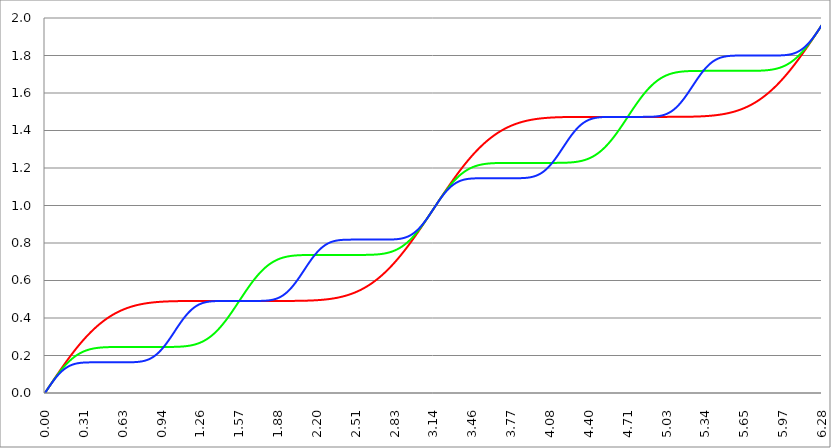
| Category | Series 1 | Series 0 | Series 2 |
|---|---|---|---|
| 0.0 | 0 | 0 | 0 |
| 0.00314159265358979 | 0.003 | 0.003 | 0.003 |
| 0.00628318530717958 | 0.006 | 0.006 | 0.006 |
| 0.00942477796076938 | 0.009 | 0.009 | 0.009 |
| 0.0125663706143592 | 0.013 | 0.013 | 0.013 |
| 0.015707963267949 | 0.016 | 0.016 | 0.016 |
| 0.0188495559215388 | 0.019 | 0.019 | 0.019 |
| 0.0219911485751285 | 0.022 | 0.022 | 0.022 |
| 0.0251327412287183 | 0.025 | 0.025 | 0.025 |
| 0.0282743338823081 | 0.028 | 0.028 | 0.028 |
| 0.0314159265358979 | 0.031 | 0.031 | 0.031 |
| 0.0345575191894877 | 0.035 | 0.034 | 0.034 |
| 0.0376991118430775 | 0.038 | 0.037 | 0.037 |
| 0.0408407044966673 | 0.041 | 0.041 | 0.04 |
| 0.0439822971502571 | 0.044 | 0.044 | 0.043 |
| 0.0471238898038469 | 0.047 | 0.047 | 0.046 |
| 0.0502654824574367 | 0.05 | 0.05 | 0.049 |
| 0.0534070751110265 | 0.053 | 0.053 | 0.052 |
| 0.0565486677646163 | 0.056 | 0.056 | 0.055 |
| 0.059690260418206 | 0.059 | 0.059 | 0.058 |
| 0.0628318530717958 | 0.063 | 0.062 | 0.061 |
| 0.0659734457253856 | 0.066 | 0.065 | 0.063 |
| 0.0691150383789754 | 0.069 | 0.068 | 0.066 |
| 0.0722566310325652 | 0.072 | 0.071 | 0.069 |
| 0.075398223686155 | 0.075 | 0.074 | 0.072 |
| 0.0785398163397448 | 0.078 | 0.077 | 0.074 |
| 0.0816814089933346 | 0.081 | 0.08 | 0.077 |
| 0.0848230016469244 | 0.084 | 0.082 | 0.08 |
| 0.0879645943005142 | 0.087 | 0.085 | 0.082 |
| 0.091106186954104 | 0.09 | 0.088 | 0.085 |
| 0.0942477796076937 | 0.093 | 0.091 | 0.087 |
| 0.0973893722612835 | 0.096 | 0.094 | 0.09 |
| 0.100530964914873 | 0.1 | 0.097 | 0.092 |
| 0.103672557568463 | 0.103 | 0.099 | 0.094 |
| 0.106814150222053 | 0.106 | 0.102 | 0.097 |
| 0.109955742875643 | 0.109 | 0.105 | 0.099 |
| 0.113097335529233 | 0.112 | 0.108 | 0.101 |
| 0.116238928182822 | 0.115 | 0.11 | 0.103 |
| 0.119380520836412 | 0.118 | 0.113 | 0.106 |
| 0.122522113490002 | 0.121 | 0.116 | 0.108 |
| 0.125663706143592 | 0.124 | 0.118 | 0.11 |
| 0.128805298797181 | 0.127 | 0.121 | 0.112 |
| 0.131946891450771 | 0.13 | 0.123 | 0.114 |
| 0.135088484104361 | 0.133 | 0.126 | 0.116 |
| 0.138230076757951 | 0.136 | 0.128 | 0.117 |
| 0.141371669411541 | 0.139 | 0.131 | 0.119 |
| 0.14451326206513 | 0.142 | 0.133 | 0.121 |
| 0.14765485471872 | 0.144 | 0.136 | 0.123 |
| 0.15079644737231 | 0.147 | 0.138 | 0.124 |
| 0.1539380400259 | 0.15 | 0.14 | 0.126 |
| 0.15707963267949 | 0.153 | 0.143 | 0.128 |
| 0.160221225333079 | 0.156 | 0.145 | 0.129 |
| 0.163362817986669 | 0.159 | 0.147 | 0.131 |
| 0.166504410640259 | 0.162 | 0.15 | 0.132 |
| 0.169646003293849 | 0.165 | 0.152 | 0.134 |
| 0.172787595947439 | 0.168 | 0.154 | 0.135 |
| 0.175929188601028 | 0.171 | 0.156 | 0.136 |
| 0.179070781254618 | 0.173 | 0.158 | 0.138 |
| 0.182212373908208 | 0.176 | 0.16 | 0.139 |
| 0.185353966561798 | 0.179 | 0.162 | 0.14 |
| 0.188495559215388 | 0.182 | 0.165 | 0.141 |
| 0.191637151868977 | 0.185 | 0.167 | 0.142 |
| 0.194778744522567 | 0.188 | 0.169 | 0.143 |
| 0.197920337176157 | 0.19 | 0.17 | 0.144 |
| 0.201061929829747 | 0.193 | 0.172 | 0.145 |
| 0.204203522483336 | 0.196 | 0.174 | 0.146 |
| 0.207345115136926 | 0.199 | 0.176 | 0.147 |
| 0.210486707790516 | 0.201 | 0.178 | 0.148 |
| 0.213628300444106 | 0.204 | 0.18 | 0.149 |
| 0.216769893097696 | 0.207 | 0.182 | 0.15 |
| 0.219911485751285 | 0.21 | 0.183 | 0.151 |
| 0.223053078404875 | 0.212 | 0.185 | 0.151 |
| 0.226194671058465 | 0.215 | 0.187 | 0.152 |
| 0.229336263712055 | 0.218 | 0.188 | 0.153 |
| 0.232477856365645 | 0.22 | 0.19 | 0.153 |
| 0.235619449019234 | 0.223 | 0.192 | 0.154 |
| 0.238761041672824 | 0.226 | 0.193 | 0.155 |
| 0.241902634326414 | 0.228 | 0.195 | 0.155 |
| 0.245044226980004 | 0.231 | 0.196 | 0.156 |
| 0.248185819633594 | 0.234 | 0.198 | 0.156 |
| 0.251327412287183 | 0.236 | 0.199 | 0.157 |
| 0.254469004940773 | 0.239 | 0.2 | 0.157 |
| 0.257610597594363 | 0.241 | 0.202 | 0.158 |
| 0.260752190247953 | 0.244 | 0.203 | 0.158 |
| 0.263893782901543 | 0.247 | 0.204 | 0.158 |
| 0.267035375555132 | 0.249 | 0.206 | 0.159 |
| 0.270176968208722 | 0.252 | 0.207 | 0.159 |
| 0.273318560862312 | 0.254 | 0.208 | 0.159 |
| 0.276460153515902 | 0.257 | 0.209 | 0.16 |
| 0.279601746169492 | 0.259 | 0.211 | 0.16 |
| 0.282743338823082 | 0.262 | 0.212 | 0.16 |
| 0.285884931476671 | 0.264 | 0.213 | 0.161 |
| 0.289026524130261 | 0.266 | 0.214 | 0.161 |
| 0.292168116783851 | 0.269 | 0.215 | 0.161 |
| 0.295309709437441 | 0.271 | 0.216 | 0.161 |
| 0.298451302091031 | 0.274 | 0.217 | 0.161 |
| 0.30159289474462 | 0.276 | 0.218 | 0.162 |
| 0.30473448739821 | 0.278 | 0.219 | 0.162 |
| 0.3078760800518 | 0.281 | 0.22 | 0.162 |
| 0.31101767270539 | 0.283 | 0.221 | 0.162 |
| 0.31415926535898 | 0.285 | 0.222 | 0.162 |
| 0.31730085801257 | 0.288 | 0.223 | 0.162 |
| 0.320442450666159 | 0.29 | 0.224 | 0.163 |
| 0.323584043319749 | 0.292 | 0.224 | 0.163 |
| 0.326725635973339 | 0.295 | 0.225 | 0.163 |
| 0.329867228626929 | 0.297 | 0.226 | 0.163 |
| 0.333008821280519 | 0.299 | 0.227 | 0.163 |
| 0.336150413934108 | 0.301 | 0.227 | 0.163 |
| 0.339292006587698 | 0.304 | 0.228 | 0.163 |
| 0.342433599241288 | 0.306 | 0.229 | 0.163 |
| 0.345575191894878 | 0.308 | 0.23 | 0.163 |
| 0.348716784548468 | 0.31 | 0.23 | 0.163 |
| 0.351858377202058 | 0.312 | 0.231 | 0.163 |
| 0.354999969855647 | 0.314 | 0.231 | 0.163 |
| 0.358141562509237 | 0.317 | 0.232 | 0.163 |
| 0.361283155162827 | 0.319 | 0.233 | 0.163 |
| 0.364424747816417 | 0.321 | 0.233 | 0.163 |
| 0.367566340470007 | 0.323 | 0.234 | 0.163 |
| 0.370707933123597 | 0.325 | 0.234 | 0.163 |
| 0.373849525777186 | 0.327 | 0.235 | 0.163 |
| 0.376991118430776 | 0.329 | 0.235 | 0.163 |
| 0.380132711084366 | 0.331 | 0.236 | 0.164 |
| 0.383274303737956 | 0.333 | 0.236 | 0.164 |
| 0.386415896391546 | 0.335 | 0.236 | 0.164 |
| 0.389557489045135 | 0.337 | 0.237 | 0.164 |
| 0.392699081698725 | 0.339 | 0.237 | 0.164 |
| 0.395840674352315 | 0.341 | 0.238 | 0.164 |
| 0.398982267005905 | 0.343 | 0.238 | 0.164 |
| 0.402123859659495 | 0.345 | 0.238 | 0.164 |
| 0.405265452313085 | 0.347 | 0.239 | 0.164 |
| 0.408407044966674 | 0.349 | 0.239 | 0.164 |
| 0.411548637620264 | 0.35 | 0.239 | 0.164 |
| 0.414690230273854 | 0.352 | 0.24 | 0.164 |
| 0.417831822927444 | 0.354 | 0.24 | 0.164 |
| 0.420973415581034 | 0.356 | 0.24 | 0.164 |
| 0.424115008234623 | 0.358 | 0.241 | 0.164 |
| 0.427256600888213 | 0.36 | 0.241 | 0.164 |
| 0.430398193541803 | 0.361 | 0.241 | 0.164 |
| 0.433539786195393 | 0.363 | 0.241 | 0.164 |
| 0.436681378848983 | 0.365 | 0.242 | 0.164 |
| 0.439822971502573 | 0.367 | 0.242 | 0.164 |
| 0.442964564156162 | 0.368 | 0.242 | 0.164 |
| 0.446106156809752 | 0.37 | 0.242 | 0.164 |
| 0.449247749463342 | 0.372 | 0.242 | 0.164 |
| 0.452389342116932 | 0.373 | 0.242 | 0.164 |
| 0.455530934770522 | 0.375 | 0.243 | 0.164 |
| 0.458672527424111 | 0.377 | 0.243 | 0.164 |
| 0.461814120077701 | 0.378 | 0.243 | 0.164 |
| 0.464955712731291 | 0.38 | 0.243 | 0.164 |
| 0.468097305384881 | 0.381 | 0.243 | 0.164 |
| 0.471238898038471 | 0.383 | 0.243 | 0.164 |
| 0.474380490692061 | 0.385 | 0.244 | 0.164 |
| 0.47752208334565 | 0.386 | 0.244 | 0.164 |
| 0.48066367599924 | 0.388 | 0.244 | 0.164 |
| 0.48380526865283 | 0.389 | 0.244 | 0.164 |
| 0.48694686130642 | 0.391 | 0.244 | 0.164 |
| 0.49008845396001 | 0.392 | 0.244 | 0.164 |
| 0.493230046613599 | 0.394 | 0.244 | 0.164 |
| 0.496371639267189 | 0.395 | 0.244 | 0.164 |
| 0.499513231920779 | 0.397 | 0.244 | 0.164 |
| 0.502654824574369 | 0.398 | 0.244 | 0.164 |
| 0.505796417227959 | 0.399 | 0.244 | 0.164 |
| 0.508938009881549 | 0.401 | 0.245 | 0.164 |
| 0.512079602535138 | 0.402 | 0.245 | 0.164 |
| 0.515221195188728 | 0.404 | 0.245 | 0.164 |
| 0.518362787842318 | 0.405 | 0.245 | 0.164 |
| 0.521504380495908 | 0.406 | 0.245 | 0.164 |
| 0.524645973149498 | 0.408 | 0.245 | 0.164 |
| 0.527787565803087 | 0.409 | 0.245 | 0.164 |
| 0.530929158456677 | 0.41 | 0.245 | 0.164 |
| 0.534070751110267 | 0.412 | 0.245 | 0.164 |
| 0.537212343763857 | 0.413 | 0.245 | 0.164 |
| 0.540353936417447 | 0.414 | 0.245 | 0.164 |
| 0.543495529071037 | 0.415 | 0.245 | 0.164 |
| 0.546637121724626 | 0.417 | 0.245 | 0.164 |
| 0.549778714378216 | 0.418 | 0.245 | 0.164 |
| 0.552920307031806 | 0.419 | 0.245 | 0.164 |
| 0.556061899685396 | 0.42 | 0.245 | 0.164 |
| 0.559203492338986 | 0.421 | 0.245 | 0.164 |
| 0.562345084992576 | 0.422 | 0.245 | 0.164 |
| 0.565486677646165 | 0.424 | 0.245 | 0.164 |
| 0.568628270299755 | 0.425 | 0.245 | 0.164 |
| 0.571769862953345 | 0.426 | 0.245 | 0.164 |
| 0.574911455606935 | 0.427 | 0.245 | 0.164 |
| 0.578053048260525 | 0.428 | 0.245 | 0.164 |
| 0.581194640914114 | 0.429 | 0.245 | 0.164 |
| 0.584336233567704 | 0.43 | 0.245 | 0.164 |
| 0.587477826221294 | 0.431 | 0.245 | 0.164 |
| 0.590619418874884 | 0.432 | 0.245 | 0.164 |
| 0.593761011528474 | 0.433 | 0.245 | 0.164 |
| 0.596902604182064 | 0.434 | 0.245 | 0.164 |
| 0.600044196835653 | 0.435 | 0.245 | 0.164 |
| 0.603185789489243 | 0.436 | 0.245 | 0.164 |
| 0.606327382142833 | 0.437 | 0.245 | 0.164 |
| 0.609468974796423 | 0.438 | 0.245 | 0.164 |
| 0.612610567450013 | 0.439 | 0.245 | 0.164 |
| 0.615752160103602 | 0.44 | 0.245 | 0.164 |
| 0.618893752757192 | 0.441 | 0.245 | 0.164 |
| 0.622035345410782 | 0.442 | 0.245 | 0.164 |
| 0.625176938064372 | 0.443 | 0.245 | 0.164 |
| 0.628318530717962 | 0.444 | 0.245 | 0.164 |
| 0.631460123371551 | 0.445 | 0.245 | 0.164 |
| 0.634601716025141 | 0.445 | 0.245 | 0.164 |
| 0.637743308678731 | 0.446 | 0.245 | 0.164 |
| 0.640884901332321 | 0.447 | 0.245 | 0.164 |
| 0.644026493985911 | 0.448 | 0.245 | 0.164 |
| 0.647168086639501 | 0.449 | 0.245 | 0.164 |
| 0.65030967929309 | 0.45 | 0.245 | 0.164 |
| 0.65345127194668 | 0.45 | 0.245 | 0.164 |
| 0.65659286460027 | 0.451 | 0.245 | 0.164 |
| 0.65973445725386 | 0.452 | 0.245 | 0.164 |
| 0.66287604990745 | 0.453 | 0.245 | 0.164 |
| 0.666017642561039 | 0.453 | 0.245 | 0.164 |
| 0.669159235214629 | 0.454 | 0.245 | 0.164 |
| 0.672300827868219 | 0.455 | 0.245 | 0.164 |
| 0.675442420521809 | 0.456 | 0.245 | 0.164 |
| 0.678584013175399 | 0.456 | 0.245 | 0.164 |
| 0.681725605828989 | 0.457 | 0.245 | 0.164 |
| 0.684867198482578 | 0.458 | 0.245 | 0.164 |
| 0.688008791136168 | 0.458 | 0.245 | 0.164 |
| 0.691150383789758 | 0.459 | 0.245 | 0.164 |
| 0.694291976443348 | 0.46 | 0.245 | 0.164 |
| 0.697433569096938 | 0.46 | 0.245 | 0.164 |
| 0.700575161750528 | 0.461 | 0.245 | 0.164 |
| 0.703716754404117 | 0.462 | 0.245 | 0.164 |
| 0.706858347057707 | 0.462 | 0.245 | 0.164 |
| 0.709999939711297 | 0.463 | 0.245 | 0.164 |
| 0.713141532364887 | 0.463 | 0.245 | 0.164 |
| 0.716283125018477 | 0.464 | 0.245 | 0.164 |
| 0.719424717672066 | 0.465 | 0.245 | 0.165 |
| 0.722566310325656 | 0.465 | 0.245 | 0.165 |
| 0.725707902979246 | 0.466 | 0.245 | 0.165 |
| 0.728849495632836 | 0.466 | 0.245 | 0.165 |
| 0.731991088286426 | 0.467 | 0.245 | 0.165 |
| 0.735132680940016 | 0.467 | 0.245 | 0.165 |
| 0.738274273593605 | 0.468 | 0.245 | 0.165 |
| 0.741415866247195 | 0.468 | 0.245 | 0.165 |
| 0.744557458900785 | 0.469 | 0.245 | 0.166 |
| 0.747699051554375 | 0.469 | 0.245 | 0.166 |
| 0.750840644207965 | 0.47 | 0.245 | 0.166 |
| 0.753982236861554 | 0.47 | 0.245 | 0.166 |
| 0.757123829515144 | 0.471 | 0.245 | 0.166 |
| 0.760265422168734 | 0.471 | 0.245 | 0.167 |
| 0.763407014822324 | 0.472 | 0.245 | 0.167 |
| 0.766548607475914 | 0.472 | 0.245 | 0.167 |
| 0.769690200129504 | 0.473 | 0.245 | 0.167 |
| 0.772831792783093 | 0.473 | 0.245 | 0.168 |
| 0.775973385436683 | 0.473 | 0.245 | 0.168 |
| 0.779114978090273 | 0.474 | 0.245 | 0.168 |
| 0.782256570743863 | 0.474 | 0.245 | 0.169 |
| 0.785398163397453 | 0.475 | 0.245 | 0.169 |
| 0.788539756051042 | 0.475 | 0.245 | 0.169 |
| 0.791681348704632 | 0.475 | 0.245 | 0.17 |
| 0.794822941358222 | 0.476 | 0.245 | 0.17 |
| 0.797964534011812 | 0.476 | 0.245 | 0.171 |
| 0.801106126665402 | 0.476 | 0.245 | 0.171 |
| 0.804247719318992 | 0.477 | 0.245 | 0.172 |
| 0.807389311972581 | 0.477 | 0.245 | 0.172 |
| 0.810530904626171 | 0.478 | 0.245 | 0.173 |
| 0.813672497279761 | 0.478 | 0.245 | 0.174 |
| 0.816814089933351 | 0.478 | 0.245 | 0.174 |
| 0.819955682586941 | 0.478 | 0.245 | 0.175 |
| 0.823097275240531 | 0.479 | 0.245 | 0.176 |
| 0.82623886789412 | 0.479 | 0.245 | 0.176 |
| 0.82938046054771 | 0.479 | 0.245 | 0.177 |
| 0.8325220532013 | 0.48 | 0.245 | 0.178 |
| 0.83566364585489 | 0.48 | 0.245 | 0.179 |
| 0.83880523850848 | 0.48 | 0.245 | 0.18 |
| 0.841946831162069 | 0.481 | 0.245 | 0.181 |
| 0.845088423815659 | 0.481 | 0.245 | 0.181 |
| 0.848230016469249 | 0.481 | 0.245 | 0.182 |
| 0.851371609122839 | 0.481 | 0.245 | 0.184 |
| 0.854513201776429 | 0.482 | 0.245 | 0.185 |
| 0.857654794430019 | 0.482 | 0.245 | 0.186 |
| 0.860796387083608 | 0.482 | 0.245 | 0.187 |
| 0.863937979737198 | 0.482 | 0.245 | 0.188 |
| 0.867079572390788 | 0.483 | 0.245 | 0.189 |
| 0.870221165044378 | 0.483 | 0.245 | 0.191 |
| 0.873362757697968 | 0.483 | 0.245 | 0.192 |
| 0.876504350351557 | 0.483 | 0.245 | 0.193 |
| 0.879645943005147 | 0.483 | 0.245 | 0.195 |
| 0.882787535658737 | 0.484 | 0.245 | 0.196 |
| 0.885929128312327 | 0.484 | 0.245 | 0.198 |
| 0.889070720965917 | 0.484 | 0.245 | 0.199 |
| 0.892212313619507 | 0.484 | 0.245 | 0.201 |
| 0.895353906273096 | 0.484 | 0.245 | 0.202 |
| 0.898495498926686 | 0.485 | 0.245 | 0.204 |
| 0.901637091580276 | 0.485 | 0.245 | 0.206 |
| 0.904778684233866 | 0.485 | 0.245 | 0.207 |
| 0.907920276887456 | 0.485 | 0.245 | 0.209 |
| 0.911061869541045 | 0.485 | 0.245 | 0.211 |
| 0.914203462194635 | 0.486 | 0.245 | 0.213 |
| 0.917345054848225 | 0.486 | 0.245 | 0.215 |
| 0.920486647501815 | 0.486 | 0.245 | 0.217 |
| 0.923628240155405 | 0.486 | 0.245 | 0.219 |
| 0.926769832808995 | 0.486 | 0.245 | 0.221 |
| 0.929911425462584 | 0.486 | 0.245 | 0.223 |
| 0.933053018116174 | 0.486 | 0.245 | 0.225 |
| 0.936194610769764 | 0.487 | 0.245 | 0.228 |
| 0.939336203423354 | 0.487 | 0.245 | 0.23 |
| 0.942477796076944 | 0.487 | 0.245 | 0.232 |
| 0.945619388730533 | 0.487 | 0.245 | 0.234 |
| 0.948760981384123 | 0.487 | 0.245 | 0.237 |
| 0.951902574037713 | 0.487 | 0.245 | 0.239 |
| 0.955044166691303 | 0.487 | 0.245 | 0.242 |
| 0.958185759344893 | 0.487 | 0.245 | 0.244 |
| 0.961327351998483 | 0.488 | 0.245 | 0.247 |
| 0.964468944652072 | 0.488 | 0.245 | 0.249 |
| 0.967610537305662 | 0.488 | 0.245 | 0.252 |
| 0.970752129959252 | 0.488 | 0.245 | 0.255 |
| 0.973893722612842 | 0.488 | 0.246 | 0.257 |
| 0.977035315266432 | 0.488 | 0.246 | 0.26 |
| 0.980176907920022 | 0.488 | 0.246 | 0.263 |
| 0.983318500573611 | 0.488 | 0.246 | 0.266 |
| 0.986460093227201 | 0.488 | 0.246 | 0.268 |
| 0.989601685880791 | 0.488 | 0.246 | 0.271 |
| 0.992743278534381 | 0.488 | 0.246 | 0.274 |
| 0.995884871187971 | 0.489 | 0.246 | 0.277 |
| 0.99902646384156 | 0.489 | 0.246 | 0.28 |
| 1.00216805649515 | 0.489 | 0.246 | 0.283 |
| 1.00530964914874 | 0.489 | 0.246 | 0.286 |
| 1.00845124180233 | 0.489 | 0.246 | 0.289 |
| 1.01159283445592 | 0.489 | 0.246 | 0.292 |
| 1.01473442710951 | 0.489 | 0.246 | 0.295 |
| 1.017876019763099 | 0.489 | 0.246 | 0.298 |
| 1.021017612416689 | 0.489 | 0.246 | 0.301 |
| 1.02415920507028 | 0.489 | 0.246 | 0.304 |
| 1.027300797723869 | 0.489 | 0.246 | 0.307 |
| 1.030442390377459 | 0.489 | 0.246 | 0.311 |
| 1.033583983031048 | 0.489 | 0.246 | 0.314 |
| 1.036725575684638 | 0.489 | 0.246 | 0.317 |
| 1.039867168338228 | 0.49 | 0.246 | 0.32 |
| 1.043008760991818 | 0.49 | 0.246 | 0.323 |
| 1.046150353645408 | 0.49 | 0.246 | 0.326 |
| 1.049291946298998 | 0.49 | 0.246 | 0.329 |
| 1.052433538952587 | 0.49 | 0.246 | 0.332 |
| 1.055575131606177 | 0.49 | 0.246 | 0.336 |
| 1.058716724259767 | 0.49 | 0.246 | 0.339 |
| 1.061858316913357 | 0.49 | 0.246 | 0.342 |
| 1.064999909566947 | 0.49 | 0.246 | 0.345 |
| 1.068141502220536 | 0.49 | 0.246 | 0.348 |
| 1.071283094874126 | 0.49 | 0.247 | 0.351 |
| 1.074424687527716 | 0.49 | 0.247 | 0.354 |
| 1.077566280181306 | 0.49 | 0.247 | 0.357 |
| 1.080707872834896 | 0.49 | 0.247 | 0.36 |
| 1.083849465488486 | 0.49 | 0.247 | 0.363 |
| 1.086991058142075 | 0.49 | 0.247 | 0.366 |
| 1.090132650795665 | 0.49 | 0.247 | 0.369 |
| 1.093274243449255 | 0.49 | 0.247 | 0.372 |
| 1.096415836102845 | 0.49 | 0.247 | 0.375 |
| 1.099557428756435 | 0.49 | 0.247 | 0.378 |
| 1.102699021410025 | 0.49 | 0.248 | 0.381 |
| 1.105840614063614 | 0.49 | 0.248 | 0.384 |
| 1.108982206717204 | 0.49 | 0.248 | 0.387 |
| 1.112123799370794 | 0.49 | 0.248 | 0.39 |
| 1.115265392024384 | 0.49 | 0.248 | 0.393 |
| 1.118406984677974 | 0.49 | 0.248 | 0.395 |
| 1.121548577331563 | 0.49 | 0.249 | 0.398 |
| 1.124690169985153 | 0.49 | 0.249 | 0.401 |
| 1.127831762638743 | 0.49 | 0.249 | 0.403 |
| 1.130973355292333 | 0.49 | 0.249 | 0.406 |
| 1.134114947945923 | 0.491 | 0.249 | 0.409 |
| 1.137256540599513 | 0.491 | 0.25 | 0.411 |
| 1.140398133253102 | 0.491 | 0.25 | 0.414 |
| 1.143539725906692 | 0.491 | 0.25 | 0.416 |
| 1.146681318560282 | 0.491 | 0.25 | 0.418 |
| 1.149822911213872 | 0.491 | 0.251 | 0.421 |
| 1.152964503867462 | 0.491 | 0.251 | 0.423 |
| 1.156106096521051 | 0.491 | 0.251 | 0.425 |
| 1.159247689174641 | 0.491 | 0.251 | 0.428 |
| 1.162389281828231 | 0.491 | 0.252 | 0.43 |
| 1.165530874481821 | 0.491 | 0.252 | 0.432 |
| 1.168672467135411 | 0.491 | 0.252 | 0.434 |
| 1.171814059789001 | 0.491 | 0.253 | 0.436 |
| 1.17495565244259 | 0.491 | 0.253 | 0.438 |
| 1.17809724509618 | 0.491 | 0.254 | 0.44 |
| 1.18123883774977 | 0.491 | 0.254 | 0.442 |
| 1.18438043040336 | 0.491 | 0.254 | 0.444 |
| 1.18752202305695 | 0.491 | 0.255 | 0.446 |
| 1.190663615710539 | 0.491 | 0.255 | 0.448 |
| 1.193805208364129 | 0.491 | 0.256 | 0.449 |
| 1.19694680101772 | 0.491 | 0.256 | 0.451 |
| 1.200088393671309 | 0.491 | 0.257 | 0.453 |
| 1.203229986324899 | 0.491 | 0.257 | 0.454 |
| 1.206371578978489 | 0.491 | 0.258 | 0.456 |
| 1.209513171632078 | 0.491 | 0.258 | 0.457 |
| 1.212654764285668 | 0.491 | 0.259 | 0.459 |
| 1.215796356939258 | 0.491 | 0.259 | 0.46 |
| 1.218937949592848 | 0.491 | 0.26 | 0.462 |
| 1.222079542246438 | 0.491 | 0.261 | 0.463 |
| 1.225221134900027 | 0.491 | 0.261 | 0.464 |
| 1.228362727553617 | 0.491 | 0.262 | 0.466 |
| 1.231504320207207 | 0.491 | 0.263 | 0.467 |
| 1.234645912860797 | 0.491 | 0.263 | 0.468 |
| 1.237787505514387 | 0.491 | 0.264 | 0.469 |
| 1.240929098167977 | 0.491 | 0.265 | 0.47 |
| 1.244070690821566 | 0.491 | 0.266 | 0.471 |
| 1.247212283475156 | 0.491 | 0.266 | 0.472 |
| 1.250353876128746 | 0.491 | 0.267 | 0.473 |
| 1.253495468782336 | 0.491 | 0.268 | 0.474 |
| 1.256637061435926 | 0.491 | 0.269 | 0.475 |
| 1.259778654089515 | 0.491 | 0.27 | 0.476 |
| 1.262920246743105 | 0.491 | 0.271 | 0.477 |
| 1.266061839396695 | 0.491 | 0.272 | 0.478 |
| 1.269203432050285 | 0.491 | 0.273 | 0.478 |
| 1.272345024703875 | 0.491 | 0.274 | 0.479 |
| 1.275486617357465 | 0.491 | 0.275 | 0.48 |
| 1.278628210011054 | 0.491 | 0.276 | 0.48 |
| 1.281769802664644 | 0.491 | 0.277 | 0.481 |
| 1.284911395318234 | 0.491 | 0.278 | 0.482 |
| 1.288052987971824 | 0.491 | 0.279 | 0.482 |
| 1.291194580625414 | 0.491 | 0.28 | 0.483 |
| 1.294336173279003 | 0.491 | 0.281 | 0.483 |
| 1.297477765932593 | 0.491 | 0.283 | 0.484 |
| 1.300619358586183 | 0.491 | 0.284 | 0.484 |
| 1.303760951239773 | 0.491 | 0.285 | 0.485 |
| 1.306902543893363 | 0.491 | 0.286 | 0.485 |
| 1.310044136546953 | 0.491 | 0.288 | 0.486 |
| 1.313185729200542 | 0.491 | 0.289 | 0.486 |
| 1.316327321854132 | 0.491 | 0.29 | 0.486 |
| 1.319468914507722 | 0.491 | 0.292 | 0.487 |
| 1.322610507161312 | 0.491 | 0.293 | 0.487 |
| 1.325752099814902 | 0.491 | 0.295 | 0.487 |
| 1.328893692468491 | 0.491 | 0.296 | 0.488 |
| 1.332035285122081 | 0.491 | 0.298 | 0.488 |
| 1.335176877775671 | 0.491 | 0.299 | 0.488 |
| 1.338318470429261 | 0.491 | 0.301 | 0.488 |
| 1.341460063082851 | 0.491 | 0.303 | 0.488 |
| 1.344601655736441 | 0.491 | 0.304 | 0.489 |
| 1.34774324839003 | 0.491 | 0.306 | 0.489 |
| 1.35088484104362 | 0.491 | 0.308 | 0.489 |
| 1.35402643369721 | 0.491 | 0.309 | 0.489 |
| 1.3571680263508 | 0.491 | 0.311 | 0.489 |
| 1.36030961900439 | 0.491 | 0.313 | 0.489 |
| 1.363451211657979 | 0.491 | 0.315 | 0.49 |
| 1.36659280431157 | 0.491 | 0.317 | 0.49 |
| 1.369734396965159 | 0.491 | 0.318 | 0.49 |
| 1.372875989618749 | 0.491 | 0.32 | 0.49 |
| 1.376017582272339 | 0.491 | 0.322 | 0.49 |
| 1.379159174925929 | 0.491 | 0.324 | 0.49 |
| 1.382300767579518 | 0.491 | 0.326 | 0.49 |
| 1.385442360233108 | 0.491 | 0.328 | 0.49 |
| 1.388583952886698 | 0.491 | 0.33 | 0.49 |
| 1.391725545540288 | 0.491 | 0.333 | 0.49 |
| 1.394867138193878 | 0.491 | 0.335 | 0.49 |
| 1.398008730847468 | 0.491 | 0.337 | 0.49 |
| 1.401150323501057 | 0.491 | 0.339 | 0.491 |
| 1.404291916154647 | 0.491 | 0.341 | 0.491 |
| 1.407433508808237 | 0.491 | 0.344 | 0.491 |
| 1.410575101461827 | 0.491 | 0.346 | 0.491 |
| 1.413716694115417 | 0.491 | 0.348 | 0.491 |
| 1.416858286769006 | 0.491 | 0.35 | 0.491 |
| 1.419999879422596 | 0.491 | 0.353 | 0.491 |
| 1.423141472076186 | 0.491 | 0.355 | 0.491 |
| 1.426283064729776 | 0.491 | 0.358 | 0.491 |
| 1.429424657383366 | 0.491 | 0.36 | 0.491 |
| 1.432566250036956 | 0.491 | 0.363 | 0.491 |
| 1.435707842690545 | 0.491 | 0.365 | 0.491 |
| 1.438849435344135 | 0.491 | 0.368 | 0.491 |
| 1.441991027997725 | 0.491 | 0.37 | 0.491 |
| 1.445132620651315 | 0.491 | 0.373 | 0.491 |
| 1.448274213304905 | 0.491 | 0.375 | 0.491 |
| 1.451415805958494 | 0.491 | 0.378 | 0.491 |
| 1.454557398612084 | 0.491 | 0.381 | 0.491 |
| 1.457698991265674 | 0.491 | 0.383 | 0.491 |
| 1.460840583919264 | 0.491 | 0.386 | 0.491 |
| 1.463982176572854 | 0.491 | 0.389 | 0.491 |
| 1.467123769226444 | 0.491 | 0.392 | 0.491 |
| 1.470265361880033 | 0.491 | 0.394 | 0.491 |
| 1.473406954533623 | 0.491 | 0.397 | 0.491 |
| 1.476548547187213 | 0.491 | 0.4 | 0.491 |
| 1.479690139840803 | 0.491 | 0.403 | 0.491 |
| 1.482831732494393 | 0.491 | 0.406 | 0.491 |
| 1.485973325147982 | 0.491 | 0.408 | 0.491 |
| 1.489114917801572 | 0.491 | 0.411 | 0.491 |
| 1.492256510455162 | 0.491 | 0.414 | 0.491 |
| 1.495398103108752 | 0.491 | 0.417 | 0.491 |
| 1.498539695762342 | 0.491 | 0.42 | 0.491 |
| 1.501681288415932 | 0.491 | 0.423 | 0.491 |
| 1.504822881069521 | 0.491 | 0.426 | 0.491 |
| 1.507964473723111 | 0.491 | 0.429 | 0.491 |
| 1.511106066376701 | 0.491 | 0.432 | 0.491 |
| 1.514247659030291 | 0.491 | 0.435 | 0.491 |
| 1.517389251683881 | 0.491 | 0.438 | 0.491 |
| 1.520530844337471 | 0.491 | 0.441 | 0.491 |
| 1.52367243699106 | 0.491 | 0.444 | 0.491 |
| 1.52681402964465 | 0.491 | 0.447 | 0.491 |
| 1.52995562229824 | 0.491 | 0.45 | 0.491 |
| 1.53309721495183 | 0.491 | 0.453 | 0.491 |
| 1.53623880760542 | 0.491 | 0.456 | 0.491 |
| 1.539380400259009 | 0.491 | 0.46 | 0.491 |
| 1.542521992912599 | 0.491 | 0.463 | 0.491 |
| 1.545663585566189 | 0.491 | 0.466 | 0.491 |
| 1.548805178219779 | 0.491 | 0.469 | 0.491 |
| 1.551946770873369 | 0.491 | 0.472 | 0.491 |
| 1.555088363526959 | 0.491 | 0.475 | 0.491 |
| 1.558229956180548 | 0.491 | 0.478 | 0.491 |
| 1.561371548834138 | 0.491 | 0.481 | 0.491 |
| 1.564513141487728 | 0.491 | 0.485 | 0.491 |
| 1.567654734141318 | 0.491 | 0.488 | 0.491 |
| 1.570796326794908 | 0.491 | 0.491 | 0.491 |
| 1.573937919448497 | 0.491 | 0.494 | 0.491 |
| 1.577079512102087 | 0.491 | 0.497 | 0.491 |
| 1.580221104755677 | 0.491 | 0.5 | 0.491 |
| 1.583362697409267 | 0.491 | 0.503 | 0.491 |
| 1.586504290062857 | 0.491 | 0.507 | 0.491 |
| 1.589645882716447 | 0.491 | 0.51 | 0.491 |
| 1.592787475370036 | 0.491 | 0.513 | 0.491 |
| 1.595929068023626 | 0.491 | 0.516 | 0.491 |
| 1.599070660677216 | 0.491 | 0.519 | 0.491 |
| 1.602212253330806 | 0.491 | 0.522 | 0.491 |
| 1.605353845984396 | 0.491 | 0.525 | 0.491 |
| 1.608495438637985 | 0.491 | 0.528 | 0.491 |
| 1.611637031291575 | 0.491 | 0.531 | 0.491 |
| 1.614778623945165 | 0.491 | 0.535 | 0.491 |
| 1.617920216598755 | 0.491 | 0.538 | 0.491 |
| 1.621061809252345 | 0.491 | 0.541 | 0.491 |
| 1.624203401905935 | 0.491 | 0.544 | 0.491 |
| 1.627344994559524 | 0.491 | 0.547 | 0.491 |
| 1.630486587213114 | 0.491 | 0.55 | 0.491 |
| 1.633628179866704 | 0.491 | 0.553 | 0.491 |
| 1.636769772520294 | 0.491 | 0.556 | 0.491 |
| 1.639911365173884 | 0.491 | 0.559 | 0.491 |
| 1.643052957827473 | 0.491 | 0.562 | 0.491 |
| 1.646194550481063 | 0.491 | 0.565 | 0.491 |
| 1.649336143134653 | 0.491 | 0.568 | 0.491 |
| 1.652477735788243 | 0.491 | 0.57 | 0.491 |
| 1.655619328441833 | 0.491 | 0.573 | 0.491 |
| 1.658760921095423 | 0.491 | 0.576 | 0.491 |
| 1.661902513749012 | 0.491 | 0.579 | 0.491 |
| 1.665044106402602 | 0.491 | 0.582 | 0.491 |
| 1.668185699056192 | 0.491 | 0.585 | 0.491 |
| 1.671327291709782 | 0.491 | 0.587 | 0.491 |
| 1.674468884363372 | 0.491 | 0.59 | 0.491 |
| 1.677610477016961 | 0.491 | 0.593 | 0.491 |
| 1.680752069670551 | 0.491 | 0.596 | 0.491 |
| 1.683893662324141 | 0.491 | 0.598 | 0.491 |
| 1.687035254977731 | 0.491 | 0.601 | 0.491 |
| 1.690176847631321 | 0.491 | 0.604 | 0.491 |
| 1.693318440284911 | 0.491 | 0.606 | 0.491 |
| 1.6964600329385 | 0.491 | 0.609 | 0.491 |
| 1.69960162559209 | 0.491 | 0.612 | 0.491 |
| 1.70274321824568 | 0.491 | 0.614 | 0.491 |
| 1.70588481089927 | 0.491 | 0.617 | 0.491 |
| 1.70902640355286 | 0.491 | 0.619 | 0.491 |
| 1.712167996206449 | 0.491 | 0.622 | 0.491 |
| 1.715309588860039 | 0.491 | 0.624 | 0.491 |
| 1.71845118151363 | 0.491 | 0.627 | 0.491 |
| 1.721592774167219 | 0.491 | 0.629 | 0.491 |
| 1.724734366820809 | 0.491 | 0.631 | 0.491 |
| 1.727875959474399 | 0.491 | 0.634 | 0.491 |
| 1.731017552127988 | 0.491 | 0.636 | 0.491 |
| 1.734159144781578 | 0.491 | 0.638 | 0.491 |
| 1.737300737435168 | 0.491 | 0.64 | 0.491 |
| 1.740442330088758 | 0.491 | 0.643 | 0.491 |
| 1.743583922742348 | 0.491 | 0.645 | 0.491 |
| 1.746725515395937 | 0.491 | 0.647 | 0.491 |
| 1.749867108049527 | 0.491 | 0.649 | 0.491 |
| 1.753008700703117 | 0.491 | 0.651 | 0.491 |
| 1.756150293356707 | 0.491 | 0.653 | 0.491 |
| 1.759291886010297 | 0.491 | 0.655 | 0.492 |
| 1.762433478663887 | 0.491 | 0.657 | 0.492 |
| 1.765575071317476 | 0.491 | 0.659 | 0.492 |
| 1.768716663971066 | 0.491 | 0.661 | 0.492 |
| 1.771858256624656 | 0.491 | 0.663 | 0.492 |
| 1.774999849278246 | 0.491 | 0.665 | 0.492 |
| 1.778141441931836 | 0.491 | 0.667 | 0.492 |
| 1.781283034585426 | 0.491 | 0.669 | 0.492 |
| 1.784424627239015 | 0.491 | 0.671 | 0.492 |
| 1.787566219892605 | 0.491 | 0.672 | 0.493 |
| 1.790707812546195 | 0.491 | 0.674 | 0.493 |
| 1.793849405199785 | 0.491 | 0.676 | 0.493 |
| 1.796990997853375 | 0.491 | 0.678 | 0.493 |
| 1.800132590506964 | 0.491 | 0.679 | 0.493 |
| 1.803274183160554 | 0.491 | 0.681 | 0.493 |
| 1.806415775814144 | 0.491 | 0.682 | 0.494 |
| 1.809557368467734 | 0.491 | 0.684 | 0.494 |
| 1.812698961121324 | 0.491 | 0.685 | 0.494 |
| 1.815840553774914 | 0.491 | 0.687 | 0.494 |
| 1.818982146428503 | 0.491 | 0.688 | 0.495 |
| 1.822123739082093 | 0.491 | 0.69 | 0.495 |
| 1.825265331735683 | 0.491 | 0.691 | 0.495 |
| 1.828406924389273 | 0.491 | 0.693 | 0.496 |
| 1.831548517042863 | 0.491 | 0.694 | 0.496 |
| 1.834690109696452 | 0.491 | 0.695 | 0.497 |
| 1.837831702350042 | 0.491 | 0.697 | 0.497 |
| 1.840973295003632 | 0.491 | 0.698 | 0.497 |
| 1.844114887657222 | 0.491 | 0.699 | 0.498 |
| 1.847256480310812 | 0.491 | 0.7 | 0.498 |
| 1.850398072964402 | 0.491 | 0.702 | 0.499 |
| 1.853539665617991 | 0.491 | 0.703 | 0.499 |
| 1.856681258271581 | 0.491 | 0.704 | 0.5 |
| 1.859822850925171 | 0.491 | 0.705 | 0.501 |
| 1.862964443578761 | 0.491 | 0.706 | 0.501 |
| 1.866106036232351 | 0.491 | 0.707 | 0.502 |
| 1.86924762888594 | 0.491 | 0.708 | 0.503 |
| 1.87238922153953 | 0.491 | 0.709 | 0.503 |
| 1.87553081419312 | 0.491 | 0.71 | 0.504 |
| 1.87867240684671 | 0.491 | 0.711 | 0.505 |
| 1.8818139995003 | 0.491 | 0.712 | 0.506 |
| 1.88495559215389 | 0.491 | 0.713 | 0.507 |
| 1.888097184807479 | 0.491 | 0.714 | 0.507 |
| 1.891238777461069 | 0.491 | 0.714 | 0.508 |
| 1.89438037011466 | 0.491 | 0.715 | 0.509 |
| 1.897521962768249 | 0.491 | 0.716 | 0.51 |
| 1.900663555421839 | 0.491 | 0.717 | 0.511 |
| 1.903805148075429 | 0.491 | 0.718 | 0.513 |
| 1.906946740729018 | 0.491 | 0.718 | 0.514 |
| 1.910088333382608 | 0.491 | 0.719 | 0.515 |
| 1.913229926036198 | 0.491 | 0.72 | 0.516 |
| 1.916371518689788 | 0.491 | 0.72 | 0.517 |
| 1.919513111343378 | 0.491 | 0.721 | 0.519 |
| 1.922654703996967 | 0.491 | 0.722 | 0.52 |
| 1.925796296650557 | 0.491 | 0.722 | 0.521 |
| 1.928937889304147 | 0.491 | 0.723 | 0.523 |
| 1.932079481957737 | 0.491 | 0.723 | 0.524 |
| 1.935221074611327 | 0.491 | 0.724 | 0.526 |
| 1.938362667264917 | 0.491 | 0.725 | 0.527 |
| 1.941504259918506 | 0.491 | 0.725 | 0.529 |
| 1.944645852572096 | 0.491 | 0.726 | 0.531 |
| 1.947787445225686 | 0.491 | 0.726 | 0.532 |
| 1.950929037879276 | 0.491 | 0.726 | 0.534 |
| 1.954070630532866 | 0.491 | 0.727 | 0.536 |
| 1.957212223186455 | 0.491 | 0.727 | 0.538 |
| 1.960353815840045 | 0.491 | 0.728 | 0.54 |
| 1.963495408493635 | 0.491 | 0.728 | 0.541 |
| 1.966637001147225 | 0.491 | 0.729 | 0.543 |
| 1.969778593800815 | 0.491 | 0.729 | 0.545 |
| 1.972920186454405 | 0.491 | 0.729 | 0.548 |
| 1.976061779107994 | 0.491 | 0.73 | 0.55 |
| 1.979203371761584 | 0.491 | 0.73 | 0.552 |
| 1.982344964415174 | 0.491 | 0.73 | 0.554 |
| 1.985486557068764 | 0.491 | 0.731 | 0.556 |
| 1.988628149722354 | 0.491 | 0.731 | 0.559 |
| 1.991769742375943 | 0.491 | 0.731 | 0.561 |
| 1.994911335029533 | 0.491 | 0.731 | 0.563 |
| 1.998052927683123 | 0.491 | 0.732 | 0.566 |
| 2.001194520336712 | 0.491 | 0.732 | 0.568 |
| 2.004336112990302 | 0.491 | 0.732 | 0.571 |
| 2.007477705643892 | 0.491 | 0.732 | 0.573 |
| 2.010619298297482 | 0.491 | 0.733 | 0.576 |
| 2.013760890951071 | 0.491 | 0.733 | 0.578 |
| 2.016902483604661 | 0.491 | 0.733 | 0.581 |
| 2.02004407625825 | 0.491 | 0.733 | 0.584 |
| 2.02318566891184 | 0.491 | 0.733 | 0.586 |
| 2.02632726156543 | 0.491 | 0.734 | 0.589 |
| 2.029468854219019 | 0.491 | 0.734 | 0.592 |
| 2.032610446872609 | 0.491 | 0.734 | 0.595 |
| 2.035752039526198 | 0.491 | 0.734 | 0.598 |
| 2.038893632179788 | 0.491 | 0.734 | 0.601 |
| 2.042035224833378 | 0.491 | 0.734 | 0.603 |
| 2.045176817486967 | 0.492 | 0.734 | 0.606 |
| 2.048318410140557 | 0.492 | 0.735 | 0.609 |
| 2.051460002794146 | 0.492 | 0.735 | 0.612 |
| 2.054601595447736 | 0.492 | 0.735 | 0.615 |
| 2.057743188101325 | 0.492 | 0.735 | 0.618 |
| 2.060884780754915 | 0.492 | 0.735 | 0.621 |
| 2.064026373408505 | 0.492 | 0.735 | 0.624 |
| 2.067167966062094 | 0.492 | 0.735 | 0.627 |
| 2.070309558715684 | 0.492 | 0.735 | 0.631 |
| 2.073451151369273 | 0.492 | 0.735 | 0.634 |
| 2.076592744022863 | 0.492 | 0.735 | 0.637 |
| 2.079734336676452 | 0.492 | 0.735 | 0.64 |
| 2.082875929330042 | 0.492 | 0.735 | 0.643 |
| 2.086017521983632 | 0.492 | 0.736 | 0.646 |
| 2.089159114637221 | 0.492 | 0.736 | 0.649 |
| 2.092300707290811 | 0.492 | 0.736 | 0.652 |
| 2.095442299944401 | 0.492 | 0.736 | 0.656 |
| 2.09858389259799 | 0.492 | 0.736 | 0.659 |
| 2.10172548525158 | 0.492 | 0.736 | 0.662 |
| 2.104867077905169 | 0.492 | 0.736 | 0.665 |
| 2.108008670558759 | 0.492 | 0.736 | 0.668 |
| 2.111150263212349 | 0.492 | 0.736 | 0.671 |
| 2.114291855865938 | 0.492 | 0.736 | 0.674 |
| 2.117433448519528 | 0.493 | 0.736 | 0.677 |
| 2.120575041173117 | 0.493 | 0.736 | 0.681 |
| 2.123716633826707 | 0.493 | 0.736 | 0.684 |
| 2.126858226480297 | 0.493 | 0.736 | 0.687 |
| 2.129999819133886 | 0.493 | 0.736 | 0.69 |
| 2.133141411787476 | 0.493 | 0.736 | 0.693 |
| 2.136283004441065 | 0.493 | 0.736 | 0.696 |
| 2.139424597094655 | 0.493 | 0.736 | 0.699 |
| 2.142566189748245 | 0.493 | 0.736 | 0.702 |
| 2.145707782401834 | 0.493 | 0.736 | 0.705 |
| 2.148849375055424 | 0.493 | 0.736 | 0.708 |
| 2.151990967709013 | 0.493 | 0.736 | 0.71 |
| 2.155132560362603 | 0.493 | 0.736 | 0.713 |
| 2.158274153016193 | 0.494 | 0.736 | 0.716 |
| 2.161415745669782 | 0.494 | 0.736 | 0.719 |
| 2.164557338323372 | 0.494 | 0.736 | 0.722 |
| 2.167698930976961 | 0.494 | 0.736 | 0.724 |
| 2.170840523630551 | 0.494 | 0.736 | 0.727 |
| 2.173982116284141 | 0.494 | 0.736 | 0.73 |
| 2.17712370893773 | 0.494 | 0.736 | 0.732 |
| 2.18026530159132 | 0.494 | 0.736 | 0.735 |
| 2.183406894244909 | 0.494 | 0.736 | 0.738 |
| 2.186548486898499 | 0.494 | 0.736 | 0.74 |
| 2.189690079552089 | 0.495 | 0.736 | 0.742 |
| 2.192831672205678 | 0.495 | 0.736 | 0.745 |
| 2.195973264859268 | 0.495 | 0.736 | 0.747 |
| 2.199114857512857 | 0.495 | 0.736 | 0.75 |
| 2.202256450166447 | 0.495 | 0.736 | 0.752 |
| 2.205398042820036 | 0.495 | 0.736 | 0.754 |
| 2.208539635473626 | 0.495 | 0.736 | 0.756 |
| 2.211681228127216 | 0.495 | 0.736 | 0.759 |
| 2.214822820780805 | 0.496 | 0.736 | 0.761 |
| 2.217964413434395 | 0.496 | 0.736 | 0.763 |
| 2.221106006087984 | 0.496 | 0.736 | 0.765 |
| 2.224247598741574 | 0.496 | 0.736 | 0.767 |
| 2.227389191395164 | 0.496 | 0.736 | 0.769 |
| 2.230530784048753 | 0.496 | 0.736 | 0.771 |
| 2.233672376702343 | 0.497 | 0.736 | 0.773 |
| 2.236813969355933 | 0.497 | 0.736 | 0.774 |
| 2.239955562009522 | 0.497 | 0.736 | 0.776 |
| 2.243097154663112 | 0.497 | 0.736 | 0.778 |
| 2.246238747316701 | 0.497 | 0.736 | 0.78 |
| 2.249380339970291 | 0.497 | 0.736 | 0.781 |
| 2.252521932623881 | 0.498 | 0.736 | 0.783 |
| 2.25566352527747 | 0.498 | 0.736 | 0.784 |
| 2.25880511793106 | 0.498 | 0.736 | 0.786 |
| 2.261946710584649 | 0.498 | 0.736 | 0.787 |
| 2.265088303238239 | 0.499 | 0.736 | 0.789 |
| 2.268229895891829 | 0.499 | 0.736 | 0.79 |
| 2.271371488545418 | 0.499 | 0.736 | 0.791 |
| 2.274513081199008 | 0.499 | 0.736 | 0.793 |
| 2.277654673852597 | 0.499 | 0.736 | 0.794 |
| 2.280796266506186 | 0.5 | 0.736 | 0.795 |
| 2.283937859159776 | 0.5 | 0.736 | 0.796 |
| 2.287079451813366 | 0.5 | 0.736 | 0.797 |
| 2.290221044466955 | 0.5 | 0.736 | 0.798 |
| 2.293362637120545 | 0.501 | 0.736 | 0.799 |
| 2.296504229774135 | 0.501 | 0.736 | 0.8 |
| 2.299645822427724 | 0.501 | 0.736 | 0.801 |
| 2.302787415081314 | 0.501 | 0.736 | 0.802 |
| 2.305929007734904 | 0.502 | 0.736 | 0.803 |
| 2.309070600388493 | 0.502 | 0.736 | 0.804 |
| 2.312212193042083 | 0.502 | 0.736 | 0.805 |
| 2.315353785695672 | 0.503 | 0.736 | 0.805 |
| 2.318495378349262 | 0.503 | 0.736 | 0.806 |
| 2.321636971002852 | 0.503 | 0.736 | 0.807 |
| 2.324778563656441 | 0.504 | 0.736 | 0.808 |
| 2.327920156310031 | 0.504 | 0.736 | 0.808 |
| 2.33106174896362 | 0.504 | 0.736 | 0.809 |
| 2.33420334161721 | 0.505 | 0.736 | 0.809 |
| 2.3373449342708 | 0.505 | 0.736 | 0.81 |
| 2.340486526924389 | 0.505 | 0.736 | 0.81 |
| 2.343628119577979 | 0.506 | 0.736 | 0.811 |
| 2.346769712231568 | 0.506 | 0.736 | 0.811 |
| 2.349911304885158 | 0.506 | 0.736 | 0.812 |
| 2.353052897538748 | 0.507 | 0.736 | 0.812 |
| 2.356194490192337 | 0.507 | 0.736 | 0.813 |
| 2.359336082845927 | 0.508 | 0.736 | 0.813 |
| 2.362477675499516 | 0.508 | 0.736 | 0.813 |
| 2.365619268153106 | 0.508 | 0.736 | 0.814 |
| 2.368760860806696 | 0.509 | 0.736 | 0.814 |
| 2.371902453460285 | 0.509 | 0.736 | 0.814 |
| 2.375044046113875 | 0.51 | 0.736 | 0.815 |
| 2.378185638767464 | 0.51 | 0.736 | 0.815 |
| 2.381327231421054 | 0.511 | 0.736 | 0.815 |
| 2.384468824074644 | 0.511 | 0.736 | 0.815 |
| 2.387610416728233 | 0.511 | 0.736 | 0.816 |
| 2.390752009381823 | 0.512 | 0.736 | 0.816 |
| 2.393893602035412 | 0.512 | 0.736 | 0.816 |
| 2.397035194689002 | 0.513 | 0.736 | 0.816 |
| 2.400176787342591 | 0.513 | 0.736 | 0.816 |
| 2.403318379996181 | 0.514 | 0.736 | 0.817 |
| 2.406459972649771 | 0.514 | 0.736 | 0.817 |
| 2.40960156530336 | 0.515 | 0.736 | 0.817 |
| 2.41274315795695 | 0.516 | 0.736 | 0.817 |
| 2.41588475061054 | 0.516 | 0.736 | 0.817 |
| 2.419026343264129 | 0.517 | 0.736 | 0.817 |
| 2.422167935917719 | 0.517 | 0.736 | 0.817 |
| 2.425309528571308 | 0.518 | 0.736 | 0.817 |
| 2.428451121224898 | 0.518 | 0.736 | 0.817 |
| 2.431592713878488 | 0.519 | 0.736 | 0.817 |
| 2.434734306532077 | 0.52 | 0.736 | 0.818 |
| 2.437875899185667 | 0.52 | 0.736 | 0.818 |
| 2.441017491839256 | 0.521 | 0.736 | 0.818 |
| 2.444159084492846 | 0.521 | 0.736 | 0.818 |
| 2.447300677146435 | 0.522 | 0.736 | 0.818 |
| 2.450442269800025 | 0.523 | 0.736 | 0.818 |
| 2.453583862453615 | 0.523 | 0.736 | 0.818 |
| 2.456725455107204 | 0.524 | 0.736 | 0.818 |
| 2.459867047760794 | 0.525 | 0.736 | 0.818 |
| 2.463008640414384 | 0.525 | 0.736 | 0.818 |
| 2.466150233067973 | 0.526 | 0.736 | 0.818 |
| 2.469291825721563 | 0.527 | 0.736 | 0.818 |
| 2.472433418375152 | 0.528 | 0.736 | 0.818 |
| 2.475575011028742 | 0.528 | 0.736 | 0.818 |
| 2.478716603682332 | 0.529 | 0.736 | 0.818 |
| 2.481858196335921 | 0.53 | 0.736 | 0.818 |
| 2.48499978898951 | 0.531 | 0.736 | 0.818 |
| 2.4881413816431 | 0.531 | 0.736 | 0.818 |
| 2.49128297429669 | 0.532 | 0.736 | 0.818 |
| 2.49442456695028 | 0.533 | 0.736 | 0.818 |
| 2.497566159603869 | 0.534 | 0.736 | 0.818 |
| 2.500707752257458 | 0.535 | 0.736 | 0.818 |
| 2.503849344911048 | 0.535 | 0.736 | 0.818 |
| 2.506990937564638 | 0.536 | 0.736 | 0.818 |
| 2.510132530218228 | 0.537 | 0.736 | 0.818 |
| 2.513274122871817 | 0.538 | 0.736 | 0.818 |
| 2.516415715525407 | 0.539 | 0.736 | 0.818 |
| 2.519557308178996 | 0.54 | 0.736 | 0.818 |
| 2.522698900832586 | 0.541 | 0.736 | 0.818 |
| 2.525840493486176 | 0.542 | 0.736 | 0.818 |
| 2.528982086139765 | 0.543 | 0.736 | 0.818 |
| 2.532123678793355 | 0.544 | 0.736 | 0.818 |
| 2.535265271446944 | 0.544 | 0.736 | 0.818 |
| 2.538406864100534 | 0.545 | 0.736 | 0.818 |
| 2.541548456754124 | 0.546 | 0.736 | 0.818 |
| 2.544690049407713 | 0.547 | 0.736 | 0.818 |
| 2.547831642061302 | 0.548 | 0.736 | 0.818 |
| 2.550973234714892 | 0.549 | 0.736 | 0.818 |
| 2.554114827368482 | 0.551 | 0.736 | 0.818 |
| 2.557256420022072 | 0.552 | 0.736 | 0.818 |
| 2.560398012675661 | 0.553 | 0.736 | 0.818 |
| 2.563539605329251 | 0.554 | 0.736 | 0.818 |
| 2.56668119798284 | 0.555 | 0.736 | 0.818 |
| 2.56982279063643 | 0.556 | 0.736 | 0.818 |
| 2.57296438329002 | 0.557 | 0.736 | 0.818 |
| 2.576105975943609 | 0.558 | 0.737 | 0.818 |
| 2.579247568597199 | 0.559 | 0.737 | 0.818 |
| 2.582389161250788 | 0.56 | 0.737 | 0.818 |
| 2.585530753904377 | 0.562 | 0.737 | 0.818 |
| 2.588672346557967 | 0.563 | 0.737 | 0.818 |
| 2.591813939211557 | 0.564 | 0.737 | 0.818 |
| 2.594955531865147 | 0.565 | 0.737 | 0.818 |
| 2.598097124518736 | 0.566 | 0.737 | 0.818 |
| 2.601238717172326 | 0.568 | 0.737 | 0.818 |
| 2.604380309825915 | 0.569 | 0.737 | 0.818 |
| 2.607521902479505 | 0.57 | 0.737 | 0.818 |
| 2.610663495133095 | 0.572 | 0.737 | 0.818 |
| 2.613805087786684 | 0.573 | 0.737 | 0.818 |
| 2.616946680440274 | 0.574 | 0.737 | 0.818 |
| 2.620088273093863 | 0.575 | 0.737 | 0.818 |
| 2.623229865747452 | 0.577 | 0.737 | 0.818 |
| 2.626371458401042 | 0.578 | 0.737 | 0.818 |
| 2.629513051054632 | 0.58 | 0.737 | 0.818 |
| 2.632654643708222 | 0.581 | 0.737 | 0.818 |
| 2.635796236361811 | 0.582 | 0.737 | 0.818 |
| 2.638937829015401 | 0.584 | 0.737 | 0.818 |
| 2.642079421668991 | 0.585 | 0.737 | 0.818 |
| 2.64522101432258 | 0.587 | 0.737 | 0.818 |
| 2.64836260697617 | 0.588 | 0.738 | 0.818 |
| 2.651504199629759 | 0.59 | 0.738 | 0.818 |
| 2.654645792283349 | 0.591 | 0.738 | 0.818 |
| 2.657787384936938 | 0.593 | 0.738 | 0.818 |
| 2.660928977590528 | 0.594 | 0.738 | 0.818 |
| 2.664070570244118 | 0.596 | 0.738 | 0.818 |
| 2.667212162897707 | 0.597 | 0.738 | 0.818 |
| 2.670353755551297 | 0.599 | 0.738 | 0.818 |
| 2.673495348204887 | 0.6 | 0.738 | 0.818 |
| 2.676636940858476 | 0.602 | 0.739 | 0.818 |
| 2.679778533512066 | 0.603 | 0.739 | 0.818 |
| 2.682920126165655 | 0.605 | 0.739 | 0.818 |
| 2.686061718819245 | 0.607 | 0.739 | 0.818 |
| 2.689203311472835 | 0.608 | 0.739 | 0.818 |
| 2.692344904126424 | 0.61 | 0.739 | 0.818 |
| 2.695486496780014 | 0.612 | 0.74 | 0.818 |
| 2.698628089433603 | 0.613 | 0.74 | 0.818 |
| 2.701769682087193 | 0.615 | 0.74 | 0.818 |
| 2.704911274740782 | 0.617 | 0.74 | 0.818 |
| 2.708052867394372 | 0.619 | 0.74 | 0.818 |
| 2.711194460047962 | 0.62 | 0.741 | 0.818 |
| 2.714336052701551 | 0.622 | 0.741 | 0.818 |
| 2.717477645355141 | 0.624 | 0.741 | 0.818 |
| 2.720619238008731 | 0.626 | 0.741 | 0.818 |
| 2.72376083066232 | 0.628 | 0.742 | 0.818 |
| 2.72690242331591 | 0.629 | 0.742 | 0.818 |
| 2.730044015969499 | 0.631 | 0.742 | 0.818 |
| 2.733185608623089 | 0.633 | 0.743 | 0.818 |
| 2.736327201276678 | 0.635 | 0.743 | 0.818 |
| 2.739468793930268 | 0.637 | 0.743 | 0.818 |
| 2.742610386583858 | 0.639 | 0.744 | 0.818 |
| 2.745751979237447 | 0.641 | 0.744 | 0.818 |
| 2.748893571891036 | 0.643 | 0.744 | 0.818 |
| 2.752035164544627 | 0.645 | 0.745 | 0.818 |
| 2.755176757198216 | 0.647 | 0.745 | 0.818 |
| 2.758318349851806 | 0.649 | 0.746 | 0.818 |
| 2.761459942505395 | 0.651 | 0.746 | 0.818 |
| 2.764601535158985 | 0.653 | 0.747 | 0.818 |
| 2.767743127812574 | 0.655 | 0.747 | 0.818 |
| 2.770884720466164 | 0.657 | 0.748 | 0.818 |
| 2.774026313119754 | 0.659 | 0.748 | 0.818 |
| 2.777167905773343 | 0.661 | 0.749 | 0.818 |
| 2.780309498426932 | 0.663 | 0.749 | 0.818 |
| 2.783451091080522 | 0.665 | 0.75 | 0.818 |
| 2.786592683734112 | 0.667 | 0.75 | 0.818 |
| 2.789734276387701 | 0.669 | 0.751 | 0.818 |
| 2.792875869041291 | 0.672 | 0.752 | 0.819 |
| 2.796017461694881 | 0.674 | 0.752 | 0.819 |
| 2.79915905434847 | 0.676 | 0.753 | 0.819 |
| 2.80230064700206 | 0.678 | 0.754 | 0.819 |
| 2.80544223965565 | 0.68 | 0.754 | 0.819 |
| 2.808583832309239 | 0.683 | 0.755 | 0.819 |
| 2.811725424962829 | 0.685 | 0.756 | 0.819 |
| 2.814867017616419 | 0.687 | 0.757 | 0.819 |
| 2.818008610270008 | 0.689 | 0.757 | 0.819 |
| 2.821150202923598 | 0.692 | 0.758 | 0.819 |
| 2.824291795577187 | 0.694 | 0.759 | 0.819 |
| 2.827433388230777 | 0.696 | 0.76 | 0.819 |
| 2.830574980884366 | 0.699 | 0.761 | 0.82 |
| 2.833716573537956 | 0.701 | 0.762 | 0.82 |
| 2.836858166191546 | 0.703 | 0.763 | 0.82 |
| 2.839999758845135 | 0.706 | 0.764 | 0.82 |
| 2.843141351498725 | 0.708 | 0.765 | 0.82 |
| 2.846282944152314 | 0.71 | 0.766 | 0.82 |
| 2.849424536805904 | 0.713 | 0.767 | 0.821 |
| 2.852566129459494 | 0.715 | 0.768 | 0.821 |
| 2.855707722113083 | 0.718 | 0.769 | 0.821 |
| 2.858849314766673 | 0.72 | 0.77 | 0.821 |
| 2.861990907420262 | 0.723 | 0.771 | 0.822 |
| 2.865132500073852 | 0.725 | 0.772 | 0.822 |
| 2.868274092727442 | 0.728 | 0.773 | 0.822 |
| 2.871415685381031 | 0.73 | 0.775 | 0.823 |
| 2.874557278034621 | 0.733 | 0.776 | 0.823 |
| 2.87769887068821 | 0.735 | 0.777 | 0.823 |
| 2.8808404633418 | 0.738 | 0.779 | 0.824 |
| 2.88398205599539 | 0.74 | 0.78 | 0.824 |
| 2.88712364864898 | 0.743 | 0.781 | 0.825 |
| 2.890265241302569 | 0.746 | 0.783 | 0.825 |
| 2.893406833956158 | 0.748 | 0.784 | 0.825 |
| 2.896548426609748 | 0.751 | 0.786 | 0.826 |
| 2.899690019263338 | 0.753 | 0.787 | 0.827 |
| 2.902831611916927 | 0.756 | 0.789 | 0.827 |
| 2.905973204570517 | 0.759 | 0.79 | 0.828 |
| 2.909114797224106 | 0.761 | 0.792 | 0.828 |
| 2.912256389877696 | 0.764 | 0.793 | 0.829 |
| 2.915397982531286 | 0.767 | 0.795 | 0.83 |
| 2.918539575184875 | 0.769 | 0.797 | 0.83 |
| 2.921681167838465 | 0.772 | 0.798 | 0.831 |
| 2.924822760492054 | 0.775 | 0.8 | 0.832 |
| 2.927964353145644 | 0.778 | 0.802 | 0.833 |
| 2.931105945799234 | 0.78 | 0.804 | 0.834 |
| 2.934247538452823 | 0.783 | 0.806 | 0.834 |
| 2.937389131106413 | 0.786 | 0.807 | 0.835 |
| 2.940530723760002 | 0.789 | 0.809 | 0.836 |
| 2.943672316413592 | 0.791 | 0.811 | 0.837 |
| 2.946813909067182 | 0.794 | 0.813 | 0.838 |
| 2.949955501720771 | 0.797 | 0.815 | 0.839 |
| 2.953097094374361 | 0.8 | 0.817 | 0.841 |
| 2.95623868702795 | 0.803 | 0.819 | 0.842 |
| 2.95938027968154 | 0.805 | 0.821 | 0.843 |
| 2.96252187233513 | 0.808 | 0.823 | 0.844 |
| 2.965663464988719 | 0.811 | 0.826 | 0.845 |
| 2.968805057642309 | 0.814 | 0.828 | 0.847 |
| 2.971946650295898 | 0.817 | 0.83 | 0.848 |
| 2.975088242949488 | 0.82 | 0.832 | 0.85 |
| 2.978229835603078 | 0.823 | 0.834 | 0.851 |
| 2.981371428256667 | 0.826 | 0.837 | 0.853 |
| 2.984513020910257 | 0.828 | 0.839 | 0.854 |
| 2.987654613563846 | 0.831 | 0.841 | 0.856 |
| 2.990796206217436 | 0.834 | 0.844 | 0.857 |
| 2.993937798871025 | 0.837 | 0.846 | 0.859 |
| 2.997079391524615 | 0.84 | 0.849 | 0.861 |
| 3.000220984178205 | 0.843 | 0.851 | 0.862 |
| 3.003362576831794 | 0.846 | 0.853 | 0.864 |
| 3.006504169485384 | 0.849 | 0.856 | 0.866 |
| 3.009645762138974 | 0.852 | 0.858 | 0.868 |
| 3.012787354792563 | 0.855 | 0.861 | 0.87 |
| 3.015928947446153 | 0.858 | 0.864 | 0.872 |
| 3.019070540099742 | 0.861 | 0.866 | 0.874 |
| 3.022212132753332 | 0.864 | 0.869 | 0.876 |
| 3.025353725406922 | 0.867 | 0.872 | 0.878 |
| 3.028495318060511 | 0.87 | 0.874 | 0.881 |
| 3.031636910714101 | 0.873 | 0.877 | 0.883 |
| 3.03477850336769 | 0.876 | 0.88 | 0.885 |
| 3.03792009602128 | 0.879 | 0.882 | 0.887 |
| 3.04106168867487 | 0.882 | 0.885 | 0.89 |
| 3.04420328132846 | 0.885 | 0.888 | 0.892 |
| 3.047344873982049 | 0.888 | 0.891 | 0.895 |
| 3.050486466635638 | 0.891 | 0.894 | 0.897 |
| 3.053628059289228 | 0.894 | 0.896 | 0.9 |
| 3.056769651942818 | 0.898 | 0.899 | 0.902 |
| 3.059911244596407 | 0.901 | 0.902 | 0.905 |
| 3.063052837249997 | 0.904 | 0.905 | 0.907 |
| 3.066194429903586 | 0.907 | 0.908 | 0.91 |
| 3.069336022557176 | 0.91 | 0.911 | 0.913 |
| 3.072477615210766 | 0.913 | 0.914 | 0.916 |
| 3.075619207864355 | 0.916 | 0.917 | 0.918 |
| 3.078760800517945 | 0.919 | 0.92 | 0.921 |
| 3.081902393171534 | 0.922 | 0.923 | 0.924 |
| 3.085043985825124 | 0.925 | 0.926 | 0.927 |
| 3.088185578478713 | 0.928 | 0.929 | 0.93 |
| 3.091327171132303 | 0.932 | 0.932 | 0.933 |
| 3.094468763785893 | 0.935 | 0.935 | 0.936 |
| 3.097610356439482 | 0.938 | 0.938 | 0.939 |
| 3.100751949093072 | 0.941 | 0.941 | 0.942 |
| 3.103893541746661 | 0.944 | 0.944 | 0.945 |
| 3.107035134400251 | 0.947 | 0.947 | 0.948 |
| 3.110176727053841 | 0.95 | 0.95 | 0.951 |
| 3.11331831970743 | 0.953 | 0.954 | 0.954 |
| 3.11645991236102 | 0.957 | 0.957 | 0.957 |
| 3.11960150501461 | 0.96 | 0.96 | 0.96 |
| 3.122743097668199 | 0.963 | 0.963 | 0.963 |
| 3.125884690321789 | 0.966 | 0.966 | 0.966 |
| 3.129026282975378 | 0.969 | 0.969 | 0.969 |
| 3.132167875628968 | 0.972 | 0.972 | 0.972 |
| 3.135309468282557 | 0.975 | 0.975 | 0.975 |
| 3.138451060936147 | 0.979 | 0.979 | 0.979 |
| 3.141592653589737 | 0.982 | 0.982 | 0.982 |
| 3.144734246243326 | 0.985 | 0.985 | 0.985 |
| 3.147875838896916 | 0.988 | 0.988 | 0.988 |
| 3.151017431550505 | 0.991 | 0.991 | 0.991 |
| 3.154159024204095 | 0.994 | 0.994 | 0.994 |
| 3.157300616857685 | 0.997 | 0.997 | 0.997 |
| 3.160442209511274 | 1.001 | 1.001 | 1.001 |
| 3.163583802164864 | 1.004 | 1.004 | 1.004 |
| 3.166725394818453 | 1.007 | 1.007 | 1.007 |
| 3.169866987472043 | 1.01 | 1.01 | 1.01 |
| 3.173008580125633 | 1.013 | 1.013 | 1.013 |
| 3.176150172779222 | 1.016 | 1.016 | 1.016 |
| 3.179291765432812 | 1.019 | 1.019 | 1.019 |
| 3.182433358086401 | 1.023 | 1.022 | 1.022 |
| 3.185574950739991 | 1.026 | 1.025 | 1.025 |
| 3.188716543393581 | 1.029 | 1.028 | 1.028 |
| 3.19185813604717 | 1.032 | 1.032 | 1.031 |
| 3.19499972870076 | 1.035 | 1.035 | 1.034 |
| 3.198141321354349 | 1.038 | 1.038 | 1.037 |
| 3.20128291400794 | 1.041 | 1.041 | 1.04 |
| 3.204424506661528 | 1.044 | 1.044 | 1.042 |
| 3.207566099315118 | 1.047 | 1.047 | 1.045 |
| 3.210707691968708 | 1.051 | 1.05 | 1.048 |
| 3.213849284622297 | 1.054 | 1.053 | 1.051 |
| 3.216990877275887 | 1.057 | 1.055 | 1.053 |
| 3.220132469929476 | 1.06 | 1.058 | 1.056 |
| 3.223274062583066 | 1.063 | 1.061 | 1.059 |
| 3.226415655236656 | 1.066 | 1.064 | 1.061 |
| 3.229557247890245 | 1.069 | 1.067 | 1.064 |
| 3.232698840543835 | 1.072 | 1.07 | 1.066 |
| 3.235840433197425 | 1.075 | 1.073 | 1.069 |
| 3.238982025851014 | 1.078 | 1.076 | 1.071 |
| 3.242123618504604 | 1.081 | 1.078 | 1.074 |
| 3.245265211158193 | 1.084 | 1.081 | 1.076 |
| 3.248406803811783 | 1.087 | 1.084 | 1.078 |
| 3.251548396465373 | 1.09 | 1.087 | 1.081 |
| 3.254689989118962 | 1.093 | 1.089 | 1.083 |
| 3.257831581772551 | 1.096 | 1.092 | 1.085 |
| 3.260973174426141 | 1.099 | 1.095 | 1.087 |
| 3.26411476707973 | 1.102 | 1.097 | 1.089 |
| 3.267256359733321 | 1.105 | 1.1 | 1.091 |
| 3.27039795238691 | 1.108 | 1.102 | 1.093 |
| 3.2735395450405 | 1.111 | 1.105 | 1.095 |
| 3.276681137694089 | 1.114 | 1.108 | 1.097 |
| 3.279822730347679 | 1.117 | 1.11 | 1.099 |
| 3.282964323001269 | 1.12 | 1.113 | 1.101 |
| 3.286105915654858 | 1.123 | 1.115 | 1.103 |
| 3.289247508308448 | 1.126 | 1.117 | 1.105 |
| 3.292389100962037 | 1.129 | 1.12 | 1.106 |
| 3.295530693615627 | 1.132 | 1.122 | 1.108 |
| 3.298672286269217 | 1.135 | 1.124 | 1.109 |
| 3.301813878922806 | 1.138 | 1.127 | 1.111 |
| 3.304955471576396 | 1.141 | 1.129 | 1.112 |
| 3.308097064229985 | 1.144 | 1.131 | 1.114 |
| 3.311238656883575 | 1.147 | 1.134 | 1.115 |
| 3.314380249537165 | 1.149 | 1.136 | 1.117 |
| 3.317521842190754 | 1.152 | 1.138 | 1.118 |
| 3.320663434844344 | 1.155 | 1.14 | 1.119 |
| 3.323805027497933 | 1.158 | 1.142 | 1.121 |
| 3.326946620151523 | 1.161 | 1.144 | 1.122 |
| 3.330088212805113 | 1.164 | 1.146 | 1.123 |
| 3.333229805458702 | 1.167 | 1.148 | 1.124 |
| 3.336371398112292 | 1.169 | 1.15 | 1.125 |
| 3.339512990765881 | 1.172 | 1.152 | 1.126 |
| 3.342654583419471 | 1.175 | 1.154 | 1.127 |
| 3.345796176073061 | 1.178 | 1.156 | 1.128 |
| 3.34893776872665 | 1.18 | 1.158 | 1.129 |
| 3.35207936138024 | 1.183 | 1.16 | 1.13 |
| 3.355220954033829 | 1.186 | 1.162 | 1.131 |
| 3.358362546687419 | 1.189 | 1.163 | 1.132 |
| 3.361504139341009 | 1.191 | 1.165 | 1.132 |
| 3.364645731994598 | 1.194 | 1.167 | 1.133 |
| 3.367787324648188 | 1.197 | 1.168 | 1.134 |
| 3.370928917301777 | 1.2 | 1.17 | 1.135 |
| 3.374070509955367 | 1.202 | 1.172 | 1.135 |
| 3.377212102608956 | 1.205 | 1.173 | 1.136 |
| 3.380353695262546 | 1.207 | 1.175 | 1.136 |
| 3.383495287916136 | 1.21 | 1.176 | 1.137 |
| 3.386636880569725 | 1.213 | 1.178 | 1.138 |
| 3.389778473223315 | 1.215 | 1.179 | 1.138 |
| 3.392920065876904 | 1.218 | 1.181 | 1.139 |
| 3.396061658530494 | 1.221 | 1.182 | 1.139 |
| 3.399203251184084 | 1.223 | 1.184 | 1.139 |
| 3.402344843837673 | 1.226 | 1.185 | 1.14 |
| 3.405486436491263 | 1.228 | 1.186 | 1.14 |
| 3.408628029144852 | 1.231 | 1.188 | 1.141 |
| 3.411769621798442 | 1.233 | 1.189 | 1.141 |
| 3.414911214452032 | 1.236 | 1.19 | 1.141 |
| 3.418052807105621 | 1.238 | 1.191 | 1.142 |
| 3.421194399759211 | 1.241 | 1.192 | 1.142 |
| 3.4243359924128 | 1.243 | 1.194 | 1.142 |
| 3.42747758506639 | 1.246 | 1.195 | 1.142 |
| 3.43061917771998 | 1.248 | 1.196 | 1.143 |
| 3.433760770373569 | 1.251 | 1.197 | 1.143 |
| 3.436902363027159 | 1.253 | 1.198 | 1.143 |
| 3.440043955680748 | 1.255 | 1.199 | 1.143 |
| 3.443185548334338 | 1.258 | 1.2 | 1.143 |
| 3.446327140987927 | 1.26 | 1.201 | 1.144 |
| 3.449468733641517 | 1.263 | 1.202 | 1.144 |
| 3.452610326295107 | 1.265 | 1.203 | 1.144 |
| 3.455751918948696 | 1.267 | 1.204 | 1.144 |
| 3.458893511602286 | 1.27 | 1.204 | 1.144 |
| 3.462035104255876 | 1.272 | 1.205 | 1.144 |
| 3.465176696909465 | 1.274 | 1.206 | 1.144 |
| 3.468318289563055 | 1.276 | 1.207 | 1.144 |
| 3.471459882216644 | 1.279 | 1.208 | 1.145 |
| 3.474601474870234 | 1.281 | 1.208 | 1.145 |
| 3.477743067523824 | 1.283 | 1.209 | 1.145 |
| 3.480884660177413 | 1.285 | 1.21 | 1.145 |
| 3.484026252831002 | 1.288 | 1.211 | 1.145 |
| 3.487167845484592 | 1.29 | 1.211 | 1.145 |
| 3.490309438138182 | 1.292 | 1.212 | 1.145 |
| 3.493451030791772 | 1.294 | 1.213 | 1.145 |
| 3.496592623445361 | 1.296 | 1.213 | 1.145 |
| 3.499734216098951 | 1.298 | 1.214 | 1.145 |
| 3.50287580875254 | 1.3 | 1.214 | 1.145 |
| 3.50601740140613 | 1.303 | 1.215 | 1.145 |
| 3.50915899405972 | 1.305 | 1.215 | 1.145 |
| 3.512300586713309 | 1.307 | 1.216 | 1.145 |
| 3.515442179366899 | 1.309 | 1.216 | 1.145 |
| 3.518583772020488 | 1.311 | 1.217 | 1.145 |
| 3.521725364674078 | 1.313 | 1.217 | 1.145 |
| 3.524866957327668 | 1.315 | 1.218 | 1.145 |
| 3.528008549981257 | 1.317 | 1.218 | 1.145 |
| 3.531150142634847 | 1.319 | 1.219 | 1.145 |
| 3.534291735288436 | 1.321 | 1.219 | 1.145 |
| 3.537433327942026 | 1.323 | 1.219 | 1.145 |
| 3.540574920595616 | 1.325 | 1.22 | 1.145 |
| 3.543716513249205 | 1.327 | 1.22 | 1.145 |
| 3.546858105902795 | 1.328 | 1.221 | 1.145 |
| 3.549999698556384 | 1.33 | 1.221 | 1.145 |
| 3.553141291209974 | 1.332 | 1.221 | 1.145 |
| 3.556282883863564 | 1.334 | 1.221 | 1.145 |
| 3.559424476517153 | 1.336 | 1.222 | 1.145 |
| 3.562566069170743 | 1.338 | 1.222 | 1.145 |
| 3.565707661824332 | 1.34 | 1.222 | 1.145 |
| 3.568849254477922 | 1.341 | 1.223 | 1.145 |
| 3.571990847131511 | 1.343 | 1.223 | 1.145 |
| 3.575132439785101 | 1.345 | 1.223 | 1.145 |
| 3.578274032438691 | 1.347 | 1.223 | 1.145 |
| 3.58141562509228 | 1.348 | 1.223 | 1.145 |
| 3.58455721774587 | 1.35 | 1.224 | 1.145 |
| 3.58769881039946 | 1.352 | 1.224 | 1.145 |
| 3.590840403053049 | 1.353 | 1.224 | 1.145 |
| 3.593981995706639 | 1.355 | 1.224 | 1.145 |
| 3.597123588360228 | 1.357 | 1.224 | 1.145 |
| 3.600265181013818 | 1.358 | 1.225 | 1.145 |
| 3.603406773667407 | 1.36 | 1.225 | 1.145 |
| 3.606548366320997 | 1.362 | 1.225 | 1.145 |
| 3.609689958974587 | 1.363 | 1.225 | 1.145 |
| 3.612831551628176 | 1.365 | 1.225 | 1.145 |
| 3.615973144281766 | 1.366 | 1.225 | 1.145 |
| 3.619114736935355 | 1.368 | 1.225 | 1.145 |
| 3.622256329588945 | 1.369 | 1.226 | 1.145 |
| 3.625397922242534 | 1.371 | 1.226 | 1.145 |
| 3.628539514896124 | 1.372 | 1.226 | 1.145 |
| 3.631681107549714 | 1.374 | 1.226 | 1.145 |
| 3.634822700203303 | 1.375 | 1.226 | 1.145 |
| 3.637964292856893 | 1.377 | 1.226 | 1.145 |
| 3.641105885510483 | 1.378 | 1.226 | 1.145 |
| 3.644247478164072 | 1.38 | 1.226 | 1.145 |
| 3.647389070817662 | 1.381 | 1.226 | 1.145 |
| 3.650530663471251 | 1.383 | 1.226 | 1.145 |
| 3.653672256124841 | 1.384 | 1.226 | 1.145 |
| 3.656813848778431 | 1.385 | 1.226 | 1.145 |
| 3.65995544143202 | 1.387 | 1.226 | 1.145 |
| 3.66309703408561 | 1.388 | 1.227 | 1.145 |
| 3.666238626739199 | 1.389 | 1.227 | 1.145 |
| 3.66938021939279 | 1.391 | 1.227 | 1.145 |
| 3.672521812046378 | 1.392 | 1.227 | 1.145 |
| 3.675663404699968 | 1.393 | 1.227 | 1.145 |
| 3.678804997353558 | 1.395 | 1.227 | 1.145 |
| 3.681946590007147 | 1.396 | 1.227 | 1.145 |
| 3.685088182660737 | 1.397 | 1.227 | 1.145 |
| 3.688229775314326 | 1.398 | 1.227 | 1.145 |
| 3.691371367967916 | 1.399 | 1.227 | 1.145 |
| 3.694512960621506 | 1.401 | 1.227 | 1.145 |
| 3.697654553275095 | 1.402 | 1.227 | 1.145 |
| 3.700796145928685 | 1.403 | 1.227 | 1.145 |
| 3.703937738582274 | 1.404 | 1.227 | 1.145 |
| 3.707079331235864 | 1.405 | 1.227 | 1.145 |
| 3.710220923889454 | 1.406 | 1.227 | 1.145 |
| 3.713362516543043 | 1.408 | 1.227 | 1.145 |
| 3.716504109196633 | 1.409 | 1.227 | 1.145 |
| 3.719645701850223 | 1.41 | 1.227 | 1.145 |
| 3.722787294503812 | 1.411 | 1.227 | 1.145 |
| 3.725928887157402 | 1.412 | 1.227 | 1.145 |
| 3.729070479810991 | 1.413 | 1.227 | 1.145 |
| 3.732212072464581 | 1.414 | 1.227 | 1.145 |
| 3.735353665118171 | 1.415 | 1.227 | 1.145 |
| 3.73849525777176 | 1.416 | 1.227 | 1.145 |
| 3.74163685042535 | 1.417 | 1.227 | 1.145 |
| 3.744778443078939 | 1.418 | 1.227 | 1.145 |
| 3.747920035732529 | 1.419 | 1.227 | 1.145 |
| 3.751061628386119 | 1.42 | 1.227 | 1.145 |
| 3.754203221039708 | 1.421 | 1.227 | 1.145 |
| 3.757344813693298 | 1.422 | 1.227 | 1.145 |
| 3.760486406346887 | 1.423 | 1.227 | 1.145 |
| 3.763627999000477 | 1.424 | 1.227 | 1.145 |
| 3.766769591654067 | 1.425 | 1.227 | 1.145 |
| 3.769911184307656 | 1.425 | 1.227 | 1.145 |
| 3.773052776961246 | 1.426 | 1.227 | 1.145 |
| 3.776194369614835 | 1.427 | 1.227 | 1.145 |
| 3.779335962268425 | 1.428 | 1.227 | 1.145 |
| 3.782477554922014 | 1.429 | 1.227 | 1.145 |
| 3.785619147575604 | 1.43 | 1.227 | 1.145 |
| 3.788760740229193 | 1.431 | 1.227 | 1.145 |
| 3.791902332882783 | 1.431 | 1.227 | 1.145 |
| 3.795043925536373 | 1.432 | 1.227 | 1.145 |
| 3.798185518189962 | 1.433 | 1.227 | 1.145 |
| 3.801327110843552 | 1.434 | 1.227 | 1.145 |
| 3.804468703497142 | 1.434 | 1.227 | 1.145 |
| 3.807610296150731 | 1.435 | 1.227 | 1.145 |
| 3.810751888804321 | 1.436 | 1.227 | 1.145 |
| 3.813893481457911 | 1.437 | 1.227 | 1.146 |
| 3.8170350741115 | 1.437 | 1.227 | 1.146 |
| 3.82017666676509 | 1.438 | 1.227 | 1.146 |
| 3.823318259418679 | 1.439 | 1.227 | 1.146 |
| 3.826459852072269 | 1.439 | 1.227 | 1.146 |
| 3.829601444725859 | 1.44 | 1.227 | 1.146 |
| 3.832743037379448 | 1.441 | 1.227 | 1.146 |
| 3.835884630033038 | 1.441 | 1.227 | 1.146 |
| 3.839026222686627 | 1.442 | 1.227 | 1.146 |
| 3.842167815340217 | 1.443 | 1.227 | 1.146 |
| 3.845309407993807 | 1.443 | 1.227 | 1.146 |
| 3.848451000647396 | 1.444 | 1.227 | 1.146 |
| 3.851592593300986 | 1.445 | 1.227 | 1.146 |
| 3.854734185954575 | 1.445 | 1.227 | 1.146 |
| 3.857875778608165 | 1.446 | 1.227 | 1.146 |
| 3.861017371261755 | 1.446 | 1.227 | 1.146 |
| 3.864158963915344 | 1.447 | 1.227 | 1.146 |
| 3.867300556568933 | 1.447 | 1.227 | 1.146 |
| 3.870442149222523 | 1.448 | 1.227 | 1.147 |
| 3.873583741876112 | 1.449 | 1.227 | 1.147 |
| 3.876725334529703 | 1.449 | 1.227 | 1.147 |
| 3.879866927183292 | 1.45 | 1.227 | 1.147 |
| 3.883008519836882 | 1.45 | 1.227 | 1.147 |
| 3.886150112490471 | 1.451 | 1.227 | 1.147 |
| 3.889291705144061 | 1.451 | 1.227 | 1.147 |
| 3.892433297797651 | 1.452 | 1.227 | 1.148 |
| 3.89557489045124 | 1.452 | 1.227 | 1.148 |
| 3.89871648310483 | 1.453 | 1.227 | 1.148 |
| 3.901858075758419 | 1.453 | 1.227 | 1.148 |
| 3.904999668412009 | 1.453 | 1.227 | 1.149 |
| 3.908141261065598 | 1.454 | 1.227 | 1.149 |
| 3.911282853719188 | 1.454 | 1.227 | 1.149 |
| 3.914424446372778 | 1.455 | 1.227 | 1.149 |
| 3.917566039026367 | 1.455 | 1.227 | 1.15 |
| 3.920707631679957 | 1.456 | 1.227 | 1.15 |
| 3.923849224333547 | 1.456 | 1.227 | 1.15 |
| 3.926990816987136 | 1.456 | 1.227 | 1.151 |
| 3.930132409640726 | 1.457 | 1.227 | 1.151 |
| 3.933274002294315 | 1.457 | 1.227 | 1.152 |
| 3.936415594947905 | 1.457 | 1.227 | 1.152 |
| 3.939557187601495 | 1.458 | 1.227 | 1.153 |
| 3.942698780255084 | 1.458 | 1.227 | 1.153 |
| 3.945840372908674 | 1.459 | 1.227 | 1.154 |
| 3.948981965562263 | 1.459 | 1.227 | 1.154 |
| 3.952123558215853 | 1.459 | 1.227 | 1.155 |
| 3.955265150869442 | 1.46 | 1.227 | 1.155 |
| 3.958406743523032 | 1.46 | 1.227 | 1.156 |
| 3.961548336176622 | 1.46 | 1.227 | 1.157 |
| 3.964689928830211 | 1.461 | 1.227 | 1.157 |
| 3.967831521483801 | 1.461 | 1.227 | 1.158 |
| 3.97097311413739 | 1.461 | 1.227 | 1.159 |
| 3.97411470679098 | 1.461 | 1.227 | 1.16 |
| 3.97725629944457 | 1.462 | 1.227 | 1.161 |
| 3.98039789209816 | 1.462 | 1.227 | 1.161 |
| 3.983539484751749 | 1.462 | 1.227 | 1.162 |
| 3.986681077405338 | 1.463 | 1.227 | 1.163 |
| 3.989822670058928 | 1.463 | 1.227 | 1.164 |
| 3.992964262712517 | 1.463 | 1.227 | 1.165 |
| 3.996105855366107 | 1.463 | 1.227 | 1.166 |
| 3.999247448019697 | 1.464 | 1.227 | 1.167 |
| 4.002389040673287 | 1.464 | 1.227 | 1.169 |
| 4.005530633326877 | 1.464 | 1.227 | 1.17 |
| 4.008672225980466 | 1.464 | 1.227 | 1.171 |
| 4.011813818634056 | 1.465 | 1.227 | 1.172 |
| 4.014955411287645 | 1.465 | 1.227 | 1.174 |
| 4.018097003941234 | 1.465 | 1.227 | 1.175 |
| 4.021238596594824 | 1.465 | 1.227 | 1.176 |
| 4.024380189248414 | 1.465 | 1.227 | 1.178 |
| 4.027521781902004 | 1.466 | 1.227 | 1.179 |
| 4.030663374555593 | 1.466 | 1.227 | 1.181 |
| 4.033804967209183 | 1.466 | 1.227 | 1.182 |
| 4.036946559862773 | 1.466 | 1.227 | 1.184 |
| 4.040088152516362 | 1.466 | 1.227 | 1.186 |
| 4.043229745169951 | 1.467 | 1.227 | 1.187 |
| 4.046371337823541 | 1.467 | 1.227 | 1.189 |
| 4.049512930477131 | 1.467 | 1.227 | 1.191 |
| 4.05265452313072 | 1.467 | 1.227 | 1.193 |
| 4.05579611578431 | 1.467 | 1.227 | 1.195 |
| 4.0589377084379 | 1.467 | 1.227 | 1.197 |
| 4.062079301091489 | 1.468 | 1.227 | 1.199 |
| 4.065220893745079 | 1.468 | 1.227 | 1.201 |
| 4.068362486398668 | 1.468 | 1.227 | 1.203 |
| 4.071504079052258 | 1.468 | 1.227 | 1.205 |
| 4.074645671705848 | 1.468 | 1.227 | 1.207 |
| 4.077787264359437 | 1.468 | 1.227 | 1.209 |
| 4.080928857013027 | 1.468 | 1.227 | 1.212 |
| 4.084070449666616 | 1.469 | 1.227 | 1.214 |
| 4.087212042320206 | 1.469 | 1.227 | 1.216 |
| 4.090353634973795 | 1.469 | 1.227 | 1.219 |
| 4.093495227627385 | 1.469 | 1.227 | 1.221 |
| 4.096636820280975 | 1.469 | 1.227 | 1.223 |
| 4.099778412934564 | 1.469 | 1.227 | 1.226 |
| 4.102920005588154 | 1.469 | 1.227 | 1.229 |
| 4.106061598241744 | 1.469 | 1.227 | 1.231 |
| 4.109203190895333 | 1.469 | 1.227 | 1.234 |
| 4.112344783548923 | 1.47 | 1.227 | 1.236 |
| 4.115486376202512 | 1.47 | 1.227 | 1.239 |
| 4.118627968856102 | 1.47 | 1.227 | 1.242 |
| 4.121769561509692 | 1.47 | 1.227 | 1.245 |
| 4.124911154163281 | 1.47 | 1.227 | 1.247 |
| 4.128052746816871 | 1.47 | 1.227 | 1.25 |
| 4.13119433947046 | 1.47 | 1.227 | 1.253 |
| 4.13433593212405 | 1.47 | 1.227 | 1.256 |
| 4.13747752477764 | 1.47 | 1.227 | 1.259 |
| 4.14061911743123 | 1.47 | 1.227 | 1.262 |
| 4.143760710084818 | 1.47 | 1.227 | 1.265 |
| 4.146902302738408 | 1.471 | 1.227 | 1.268 |
| 4.150043895391998 | 1.471 | 1.227 | 1.271 |
| 4.153185488045588 | 1.471 | 1.227 | 1.274 |
| 4.156327080699177 | 1.471 | 1.227 | 1.277 |
| 4.159468673352766 | 1.471 | 1.227 | 1.28 |
| 4.162610266006356 | 1.471 | 1.227 | 1.283 |
| 4.165751858659946 | 1.471 | 1.228 | 1.286 |
| 4.168893451313535 | 1.471 | 1.228 | 1.289 |
| 4.172035043967125 | 1.471 | 1.228 | 1.292 |
| 4.175176636620715 | 1.471 | 1.228 | 1.295 |
| 4.178318229274304 | 1.471 | 1.228 | 1.299 |
| 4.181459821927894 | 1.471 | 1.228 | 1.302 |
| 4.184601414581484 | 1.471 | 1.228 | 1.305 |
| 4.187743007235073 | 1.471 | 1.228 | 1.308 |
| 4.190884599888663 | 1.471 | 1.228 | 1.311 |
| 4.194026192542252 | 1.471 | 1.228 | 1.314 |
| 4.197167785195842 | 1.472 | 1.228 | 1.317 |
| 4.200309377849432 | 1.472 | 1.228 | 1.321 |
| 4.203450970503021 | 1.472 | 1.228 | 1.324 |
| 4.206592563156611 | 1.472 | 1.228 | 1.327 |
| 4.2097341558102 | 1.472 | 1.228 | 1.33 |
| 4.21287574846379 | 1.472 | 1.228 | 1.333 |
| 4.21601734111738 | 1.472 | 1.228 | 1.336 |
| 4.21915893377097 | 1.472 | 1.228 | 1.339 |
| 4.222300526424559 | 1.472 | 1.229 | 1.342 |
| 4.225442119078148 | 1.472 | 1.229 | 1.345 |
| 4.228583711731738 | 1.472 | 1.229 | 1.348 |
| 4.231725304385327 | 1.472 | 1.229 | 1.351 |
| 4.234866897038917 | 1.472 | 1.229 | 1.354 |
| 4.238008489692506 | 1.472 | 1.229 | 1.357 |
| 4.241150082346096 | 1.472 | 1.229 | 1.36 |
| 4.244291674999685 | 1.472 | 1.229 | 1.363 |
| 4.247433267653276 | 1.472 | 1.229 | 1.366 |
| 4.250574860306865 | 1.472 | 1.23 | 1.369 |
| 4.253716452960455 | 1.472 | 1.23 | 1.372 |
| 4.256858045614044 | 1.472 | 1.23 | 1.374 |
| 4.259999638267634 | 1.472 | 1.23 | 1.377 |
| 4.263141230921224 | 1.472 | 1.23 | 1.38 |
| 4.266282823574813 | 1.472 | 1.23 | 1.382 |
| 4.269424416228403 | 1.472 | 1.231 | 1.385 |
| 4.272566008881992 | 1.472 | 1.231 | 1.388 |
| 4.275707601535582 | 1.472 | 1.231 | 1.39 |
| 4.27884919418917 | 1.472 | 1.231 | 1.393 |
| 4.28199078684276 | 1.472 | 1.232 | 1.395 |
| 4.285132379496351 | 1.472 | 1.232 | 1.398 |
| 4.28827397214994 | 1.472 | 1.232 | 1.4 |
| 4.29141556480353 | 1.472 | 1.232 | 1.403 |
| 4.294557157457119 | 1.472 | 1.233 | 1.405 |
| 4.29769875011071 | 1.472 | 1.233 | 1.407 |
| 4.300840342764299 | 1.472 | 1.233 | 1.409 |
| 4.303981935417888 | 1.472 | 1.234 | 1.412 |
| 4.307123528071478 | 1.472 | 1.234 | 1.414 |
| 4.310265120725067 | 1.472 | 1.234 | 1.416 |
| 4.313406713378657 | 1.472 | 1.235 | 1.418 |
| 4.316548306032247 | 1.472 | 1.235 | 1.42 |
| 4.319689898685836 | 1.472 | 1.235 | 1.422 |
| 4.322831491339426 | 1.472 | 1.236 | 1.424 |
| 4.325973083993015 | 1.472 | 1.236 | 1.426 |
| 4.329114676646605 | 1.472 | 1.237 | 1.428 |
| 4.332256269300195 | 1.472 | 1.237 | 1.429 |
| 4.335397861953784 | 1.472 | 1.237 | 1.431 |
| 4.338539454607374 | 1.472 | 1.238 | 1.433 |
| 4.341681047260963 | 1.472 | 1.238 | 1.435 |
| 4.344822639914553 | 1.473 | 1.239 | 1.436 |
| 4.347964232568143 | 1.473 | 1.239 | 1.438 |
| 4.351105825221732 | 1.473 | 1.24 | 1.439 |
| 4.354247417875322 | 1.473 | 1.241 | 1.441 |
| 4.357389010528911 | 1.473 | 1.241 | 1.442 |
| 4.360530603182501 | 1.473 | 1.242 | 1.444 |
| 4.36367219583609 | 1.473 | 1.242 | 1.445 |
| 4.36681378848968 | 1.473 | 1.243 | 1.446 |
| 4.36995538114327 | 1.473 | 1.244 | 1.447 |
| 4.373096973796859 | 1.473 | 1.244 | 1.449 |
| 4.376238566450449 | 1.473 | 1.245 | 1.45 |
| 4.379380159104038 | 1.473 | 1.246 | 1.451 |
| 4.382521751757628 | 1.473 | 1.247 | 1.452 |
| 4.385663344411217 | 1.473 | 1.247 | 1.453 |
| 4.388804937064807 | 1.473 | 1.248 | 1.454 |
| 4.391946529718397 | 1.473 | 1.249 | 1.455 |
| 4.395088122371987 | 1.473 | 1.25 | 1.456 |
| 4.398229715025576 | 1.473 | 1.251 | 1.457 |
| 4.401371307679165 | 1.473 | 1.252 | 1.458 |
| 4.404512900332755 | 1.473 | 1.253 | 1.459 |
| 4.407654492986345 | 1.473 | 1.254 | 1.459 |
| 4.410796085639934 | 1.473 | 1.254 | 1.46 |
| 4.413937678293524 | 1.473 | 1.255 | 1.461 |
| 4.417079270947114 | 1.473 | 1.256 | 1.462 |
| 4.420220863600703 | 1.473 | 1.258 | 1.462 |
| 4.423362456254293 | 1.473 | 1.259 | 1.463 |
| 4.426504048907883 | 1.473 | 1.26 | 1.463 |
| 4.429645641561472 | 1.473 | 1.261 | 1.464 |
| 4.432787234215062 | 1.473 | 1.262 | 1.465 |
| 4.435928826868651 | 1.473 | 1.263 | 1.465 |
| 4.43907041952224 | 1.473 | 1.264 | 1.466 |
| 4.44221201217583 | 1.473 | 1.266 | 1.466 |
| 4.44535360482942 | 1.473 | 1.267 | 1.467 |
| 4.44849519748301 | 1.473 | 1.268 | 1.467 |
| 4.4516367901366 | 1.473 | 1.269 | 1.467 |
| 4.454778382790188 | 1.473 | 1.271 | 1.468 |
| 4.457919975443779 | 1.473 | 1.272 | 1.468 |
| 4.461061568097368 | 1.473 | 1.274 | 1.468 |
| 4.464203160750958 | 1.473 | 1.275 | 1.469 |
| 4.467344753404547 | 1.473 | 1.277 | 1.469 |
| 4.470486346058137 | 1.473 | 1.278 | 1.469 |
| 4.473627938711726 | 1.473 | 1.28 | 1.47 |
| 4.476769531365316 | 1.473 | 1.281 | 1.47 |
| 4.479911124018905 | 1.473 | 1.283 | 1.47 |
| 4.483052716672495 | 1.473 | 1.284 | 1.47 |
| 4.486194309326085 | 1.473 | 1.286 | 1.47 |
| 4.489335901979674 | 1.473 | 1.288 | 1.471 |
| 4.492477494633264 | 1.473 | 1.289 | 1.471 |
| 4.495619087286854 | 1.473 | 1.291 | 1.471 |
| 4.498760679940443 | 1.473 | 1.293 | 1.471 |
| 4.501902272594033 | 1.473 | 1.295 | 1.471 |
| 4.505043865247622 | 1.473 | 1.296 | 1.471 |
| 4.508185457901212 | 1.473 | 1.298 | 1.471 |
| 4.511327050554801 | 1.473 | 1.3 | 1.472 |
| 4.514468643208391 | 1.473 | 1.302 | 1.472 |
| 4.517610235861981 | 1.473 | 1.304 | 1.472 |
| 4.520751828515571 | 1.473 | 1.306 | 1.472 |
| 4.52389342116916 | 1.473 | 1.308 | 1.472 |
| 4.52703501382275 | 1.473 | 1.31 | 1.472 |
| 4.530176606476339 | 1.473 | 1.312 | 1.472 |
| 4.533318199129928 | 1.473 | 1.314 | 1.472 |
| 4.536459791783518 | 1.473 | 1.316 | 1.472 |
| 4.539601384437108 | 1.473 | 1.319 | 1.472 |
| 4.542742977090698 | 1.473 | 1.321 | 1.472 |
| 4.545884569744287 | 1.473 | 1.323 | 1.472 |
| 4.549026162397876 | 1.473 | 1.325 | 1.472 |
| 4.552167755051466 | 1.473 | 1.328 | 1.472 |
| 4.555309347705056 | 1.473 | 1.33 | 1.472 |
| 4.558450940358646 | 1.473 | 1.332 | 1.472 |
| 4.561592533012235 | 1.473 | 1.335 | 1.472 |
| 4.564734125665825 | 1.473 | 1.337 | 1.472 |
| 4.567875718319415 | 1.473 | 1.339 | 1.473 |
| 4.571017310973004 | 1.473 | 1.342 | 1.473 |
| 4.574158903626594 | 1.473 | 1.344 | 1.473 |
| 4.577300496280183 | 1.473 | 1.347 | 1.473 |
| 4.580442088933772 | 1.473 | 1.349 | 1.473 |
| 4.583583681587362 | 1.473 | 1.352 | 1.473 |
| 4.586725274240952 | 1.473 | 1.355 | 1.473 |
| 4.589866866894542 | 1.473 | 1.357 | 1.473 |
| 4.593008459548131 | 1.473 | 1.36 | 1.473 |
| 4.596150052201721 | 1.473 | 1.362 | 1.473 |
| 4.59929164485531 | 1.473 | 1.365 | 1.473 |
| 4.6024332375089 | 1.473 | 1.368 | 1.473 |
| 4.60557483016249 | 1.473 | 1.371 | 1.473 |
| 4.608716422816079 | 1.473 | 1.373 | 1.473 |
| 4.611858015469668 | 1.473 | 1.376 | 1.473 |
| 4.614999608123258 | 1.473 | 1.379 | 1.473 |
| 4.618141200776848 | 1.473 | 1.382 | 1.473 |
| 4.621282793430437 | 1.473 | 1.384 | 1.473 |
| 4.624424386084027 | 1.473 | 1.387 | 1.473 |
| 4.627565978737617 | 1.473 | 1.39 | 1.473 |
| 4.630707571391206 | 1.473 | 1.393 | 1.473 |
| 4.633849164044795 | 1.473 | 1.396 | 1.473 |
| 4.636990756698386 | 1.473 | 1.399 | 1.473 |
| 4.640132349351975 | 1.473 | 1.402 | 1.473 |
| 4.643273942005564 | 1.473 | 1.405 | 1.473 |
| 4.646415534659154 | 1.473 | 1.408 | 1.473 |
| 4.649557127312744 | 1.473 | 1.411 | 1.473 |
| 4.652698719966334 | 1.473 | 1.414 | 1.473 |
| 4.655840312619923 | 1.473 | 1.417 | 1.473 |
| 4.658981905273513 | 1.473 | 1.42 | 1.473 |
| 4.662123497927102 | 1.473 | 1.423 | 1.473 |
| 4.665265090580692 | 1.473 | 1.426 | 1.473 |
| 4.668406683234282 | 1.473 | 1.429 | 1.473 |
| 4.671548275887871 | 1.473 | 1.432 | 1.473 |
| 4.674689868541461 | 1.473 | 1.435 | 1.473 |
| 4.67783146119505 | 1.473 | 1.438 | 1.473 |
| 4.68097305384864 | 1.473 | 1.441 | 1.473 |
| 4.68411464650223 | 1.473 | 1.444 | 1.473 |
| 4.687256239155819 | 1.473 | 1.448 | 1.473 |
| 4.690397831809409 | 1.473 | 1.451 | 1.473 |
| 4.693539424462998 | 1.473 | 1.454 | 1.473 |
| 4.696681017116588 | 1.473 | 1.457 | 1.473 |
| 4.699822609770177 | 1.473 | 1.46 | 1.473 |
| 4.702964202423767 | 1.473 | 1.463 | 1.473 |
| 4.706105795077356 | 1.473 | 1.466 | 1.473 |
| 4.709247387730946 | 1.473 | 1.469 | 1.473 |
| 4.712388980384535 | 1.473 | 1.473 | 1.473 |
| 4.715530573038126 | 1.473 | 1.476 | 1.473 |
| 4.718672165691715 | 1.473 | 1.479 | 1.473 |
| 4.721813758345305 | 1.473 | 1.482 | 1.473 |
| 4.724955350998894 | 1.473 | 1.485 | 1.473 |
| 4.728096943652484 | 1.473 | 1.488 | 1.473 |
| 4.731238536306074 | 1.473 | 1.491 | 1.473 |
| 4.734380128959663 | 1.473 | 1.495 | 1.473 |
| 4.737521721613253 | 1.473 | 1.498 | 1.473 |
| 4.740663314266842 | 1.473 | 1.501 | 1.473 |
| 4.743804906920432 | 1.473 | 1.504 | 1.473 |
| 4.74694649957402 | 1.473 | 1.507 | 1.473 |
| 4.750088092227611 | 1.473 | 1.51 | 1.473 |
| 4.7532296848812 | 1.473 | 1.513 | 1.473 |
| 4.75637127753479 | 1.473 | 1.516 | 1.473 |
| 4.75951287018838 | 1.473 | 1.519 | 1.473 |
| 4.76265446284197 | 1.473 | 1.522 | 1.473 |
| 4.765796055495559 | 1.473 | 1.525 | 1.473 |
| 4.768937648149149 | 1.473 | 1.528 | 1.473 |
| 4.772079240802738 | 1.473 | 1.531 | 1.473 |
| 4.775220833456327 | 1.473 | 1.534 | 1.473 |
| 4.778362426109917 | 1.473 | 1.537 | 1.473 |
| 4.781504018763507 | 1.473 | 1.54 | 1.473 |
| 4.784645611417097 | 1.473 | 1.543 | 1.473 |
| 4.787787204070686 | 1.473 | 1.546 | 1.473 |
| 4.790928796724275 | 1.473 | 1.549 | 1.473 |
| 4.794070389377865 | 1.473 | 1.552 | 1.473 |
| 4.797211982031455 | 1.473 | 1.555 | 1.473 |
| 4.800353574685045 | 1.473 | 1.558 | 1.473 |
| 4.803495167338634 | 1.473 | 1.561 | 1.473 |
| 4.806636759992224 | 1.473 | 1.564 | 1.473 |
| 4.809778352645814 | 1.473 | 1.566 | 1.473 |
| 4.812919945299403 | 1.473 | 1.569 | 1.473 |
| 4.816061537952993 | 1.473 | 1.572 | 1.473 |
| 4.819203130606582 | 1.473 | 1.575 | 1.473 |
| 4.822344723260172 | 1.473 | 1.577 | 1.473 |
| 4.825486315913761 | 1.473 | 1.58 | 1.473 |
| 4.828627908567351 | 1.473 | 1.583 | 1.473 |
| 4.83176950122094 | 1.473 | 1.585 | 1.473 |
| 4.83491109387453 | 1.473 | 1.588 | 1.473 |
| 4.83805268652812 | 1.473 | 1.591 | 1.473 |
| 4.841194279181709 | 1.473 | 1.593 | 1.473 |
| 4.844335871835299 | 1.473 | 1.596 | 1.473 |
| 4.847477464488889 | 1.473 | 1.598 | 1.473 |
| 4.850619057142478 | 1.473 | 1.601 | 1.473 |
| 4.853760649796068 | 1.473 | 1.603 | 1.473 |
| 4.856902242449657 | 1.473 | 1.606 | 1.473 |
| 4.860043835103247 | 1.473 | 1.608 | 1.473 |
| 4.863185427756837 | 1.473 | 1.611 | 1.473 |
| 4.866327020410426 | 1.473 | 1.613 | 1.473 |
| 4.869468613064015 | 1.473 | 1.615 | 1.473 |
| 4.872610205717605 | 1.473 | 1.618 | 1.473 |
| 4.875751798371195 | 1.473 | 1.62 | 1.473 |
| 4.878893391024784 | 1.473 | 1.622 | 1.473 |
| 4.882034983678374 | 1.473 | 1.624 | 1.473 |
| 4.885176576331964 | 1.473 | 1.627 | 1.473 |
| 4.888318168985553 | 1.473 | 1.629 | 1.473 |
| 4.891459761639143 | 1.473 | 1.631 | 1.473 |
| 4.894601354292733 | 1.473 | 1.633 | 1.473 |
| 4.897742946946322 | 1.473 | 1.635 | 1.473 |
| 4.900884539599912 | 1.473 | 1.637 | 1.473 |
| 4.904026132253501 | 1.473 | 1.639 | 1.473 |
| 4.907167724907091 | 1.473 | 1.641 | 1.473 |
| 4.91030931756068 | 1.473 | 1.643 | 1.474 |
| 4.91345091021427 | 1.473 | 1.645 | 1.474 |
| 4.91659250286786 | 1.473 | 1.647 | 1.474 |
| 4.91973409552145 | 1.473 | 1.649 | 1.474 |
| 4.922875688175039 | 1.473 | 1.651 | 1.474 |
| 4.926017280828628 | 1.473 | 1.652 | 1.474 |
| 4.929158873482218 | 1.473 | 1.654 | 1.474 |
| 4.932300466135808 | 1.473 | 1.656 | 1.474 |
| 4.935442058789397 | 1.473 | 1.658 | 1.475 |
| 4.938583651442987 | 1.473 | 1.659 | 1.475 |
| 4.941725244096576 | 1.473 | 1.661 | 1.475 |
| 4.944866836750166 | 1.473 | 1.663 | 1.475 |
| 4.948008429403755 | 1.473 | 1.664 | 1.475 |
| 4.951150022057345 | 1.473 | 1.666 | 1.476 |
| 4.954291614710935 | 1.473 | 1.667 | 1.476 |
| 4.957433207364524 | 1.473 | 1.669 | 1.476 |
| 4.960574800018114 | 1.473 | 1.67 | 1.477 |
| 4.963716392671704 | 1.473 | 1.672 | 1.477 |
| 4.966857985325293 | 1.473 | 1.673 | 1.477 |
| 4.969999577978883 | 1.473 | 1.674 | 1.478 |
| 4.973141170632472 | 1.473 | 1.676 | 1.478 |
| 4.976282763286062 | 1.473 | 1.677 | 1.478 |
| 4.979424355939651 | 1.473 | 1.678 | 1.479 |
| 4.982565948593241 | 1.473 | 1.68 | 1.479 |
| 4.985707541246831 | 1.473 | 1.681 | 1.48 |
| 4.98884913390042 | 1.473 | 1.682 | 1.48 |
| 4.99199072655401 | 1.473 | 1.683 | 1.481 |
| 4.9951323192076 | 1.473 | 1.684 | 1.481 |
| 4.99827391186119 | 1.473 | 1.686 | 1.482 |
| 5.00141550451478 | 1.473 | 1.687 | 1.482 |
| 5.004557097168369 | 1.473 | 1.688 | 1.483 |
| 5.007698689821958 | 1.473 | 1.689 | 1.484 |
| 5.010840282475548 | 1.473 | 1.69 | 1.484 |
| 5.013981875129137 | 1.473 | 1.691 | 1.485 |
| 5.017123467782727 | 1.473 | 1.692 | 1.486 |
| 5.020265060436317 | 1.473 | 1.693 | 1.487 |
| 5.023406653089906 | 1.473 | 1.694 | 1.487 |
| 5.026548245743496 | 1.473 | 1.694 | 1.488 |
| 5.029689838397085 | 1.473 | 1.695 | 1.489 |
| 5.032831431050674 | 1.473 | 1.696 | 1.49 |
| 5.035973023704264 | 1.473 | 1.697 | 1.491 |
| 5.039114616357854 | 1.473 | 1.698 | 1.492 |
| 5.042256209011444 | 1.473 | 1.699 | 1.493 |
| 5.045397801665033 | 1.473 | 1.699 | 1.494 |
| 5.048539394318622 | 1.473 | 1.7 | 1.495 |
| 5.051680986972213 | 1.473 | 1.701 | 1.497 |
| 5.054822579625802 | 1.473 | 1.701 | 1.498 |
| 5.057964172279392 | 1.473 | 1.702 | 1.499 |
| 5.061105764932981 | 1.473 | 1.703 | 1.5 |
| 5.064247357586571 | 1.473 | 1.703 | 1.502 |
| 5.067388950240161 | 1.473 | 1.704 | 1.503 |
| 5.07053054289375 | 1.473 | 1.705 | 1.505 |
| 5.07367213554734 | 1.473 | 1.705 | 1.506 |
| 5.07681372820093 | 1.473 | 1.706 | 1.508 |
| 5.079955320854519 | 1.473 | 1.706 | 1.509 |
| 5.083096913508108 | 1.473 | 1.707 | 1.511 |
| 5.086238506161698 | 1.473 | 1.707 | 1.512 |
| 5.089380098815288 | 1.473 | 1.708 | 1.514 |
| 5.092521691468877 | 1.473 | 1.708 | 1.516 |
| 5.095663284122466 | 1.473 | 1.709 | 1.518 |
| 5.098804876776057 | 1.473 | 1.709 | 1.519 |
| 5.101946469429646 | 1.473 | 1.71 | 1.521 |
| 5.105088062083236 | 1.473 | 1.71 | 1.523 |
| 5.108229654736825 | 1.473 | 1.71 | 1.525 |
| 5.111371247390415 | 1.473 | 1.711 | 1.527 |
| 5.114512840044005 | 1.473 | 1.711 | 1.529 |
| 5.117654432697594 | 1.473 | 1.711 | 1.531 |
| 5.120796025351184 | 1.473 | 1.712 | 1.534 |
| 5.123937618004773 | 1.473 | 1.712 | 1.536 |
| 5.127079210658363 | 1.473 | 1.712 | 1.538 |
| 5.130220803311953 | 1.473 | 1.713 | 1.54 |
| 5.133362395965542 | 1.473 | 1.713 | 1.543 |
| 5.136503988619131 | 1.473 | 1.713 | 1.545 |
| 5.13964558127272 | 1.473 | 1.713 | 1.547 |
| 5.142787173926311 | 1.473 | 1.714 | 1.55 |
| 5.1459287665799 | 1.473 | 1.714 | 1.552 |
| 5.14907035923349 | 1.473 | 1.714 | 1.555 |
| 5.15221195188708 | 1.473 | 1.714 | 1.558 |
| 5.15535354454067 | 1.473 | 1.715 | 1.56 |
| 5.158495137194259 | 1.473 | 1.715 | 1.563 |
| 5.161636729847848 | 1.473 | 1.715 | 1.565 |
| 5.164778322501438 | 1.473 | 1.715 | 1.568 |
| 5.167919915155028 | 1.473 | 1.715 | 1.571 |
| 5.171061507808617 | 1.473 | 1.715 | 1.574 |
| 5.174203100462206 | 1.473 | 1.716 | 1.577 |
| 5.177344693115796 | 1.473 | 1.716 | 1.579 |
| 5.180486285769386 | 1.473 | 1.716 | 1.582 |
| 5.183627878422976 | 1.473 | 1.716 | 1.585 |
| 5.186769471076565 | 1.473 | 1.716 | 1.588 |
| 5.189911063730155 | 1.473 | 1.716 | 1.591 |
| 5.193052656383744 | 1.473 | 1.716 | 1.594 |
| 5.196194249037334 | 1.473 | 1.716 | 1.597 |
| 5.199335841690924 | 1.473 | 1.717 | 1.6 |
| 5.202477434344513 | 1.473 | 1.717 | 1.603 |
| 5.205619026998103 | 1.473 | 1.717 | 1.606 |
| 5.208760619651692 | 1.473 | 1.717 | 1.609 |
| 5.211902212305282 | 1.474 | 1.717 | 1.612 |
| 5.215043804958871 | 1.474 | 1.717 | 1.615 |
| 5.218185397612461 | 1.474 | 1.717 | 1.618 |
| 5.221326990266051 | 1.474 | 1.717 | 1.622 |
| 5.22446858291964 | 1.474 | 1.717 | 1.625 |
| 5.22761017557323 | 1.474 | 1.717 | 1.628 |
| 5.23075176822682 | 1.474 | 1.717 | 1.631 |
| 5.23389336088041 | 1.474 | 1.717 | 1.634 |
| 5.237034953533999 | 1.474 | 1.717 | 1.637 |
| 5.240176546187588 | 1.474 | 1.717 | 1.64 |
| 5.243318138841178 | 1.474 | 1.718 | 1.644 |
| 5.246459731494767 | 1.474 | 1.718 | 1.647 |
| 5.249601324148357 | 1.474 | 1.718 | 1.65 |
| 5.252742916801947 | 1.474 | 1.718 | 1.653 |
| 5.255884509455536 | 1.474 | 1.718 | 1.656 |
| 5.259026102109125 | 1.474 | 1.718 | 1.659 |
| 5.262167694762715 | 1.474 | 1.718 | 1.662 |
| 5.265309287416305 | 1.474 | 1.718 | 1.665 |
| 5.268450880069895 | 1.474 | 1.718 | 1.668 |
| 5.271592472723484 | 1.475 | 1.718 | 1.671 |
| 5.274734065377074 | 1.475 | 1.718 | 1.674 |
| 5.277875658030664 | 1.475 | 1.718 | 1.677 |
| 5.281017250684253 | 1.475 | 1.718 | 1.68 |
| 5.284158843337843 | 1.475 | 1.718 | 1.683 |
| 5.287300435991432 | 1.475 | 1.718 | 1.686 |
| 5.290442028645022 | 1.475 | 1.718 | 1.689 |
| 5.293583621298612 | 1.475 | 1.718 | 1.692 |
| 5.296725213952201 | 1.475 | 1.718 | 1.695 |
| 5.299866806605791 | 1.475 | 1.718 | 1.698 |
| 5.30300839925938 | 1.475 | 1.718 | 1.701 |
| 5.30614999191297 | 1.475 | 1.718 | 1.703 |
| 5.30929158456656 | 1.476 | 1.718 | 1.706 |
| 5.312433177220149 | 1.476 | 1.718 | 1.709 |
| 5.315574769873739 | 1.476 | 1.718 | 1.711 |
| 5.318716362527328 | 1.476 | 1.718 | 1.714 |
| 5.321857955180918 | 1.476 | 1.718 | 1.717 |
| 5.324999547834508 | 1.476 | 1.718 | 1.719 |
| 5.328141140488097 | 1.476 | 1.718 | 1.722 |
| 5.331282733141686 | 1.476 | 1.718 | 1.724 |
| 5.334424325795276 | 1.476 | 1.718 | 1.727 |
| 5.337565918448866 | 1.477 | 1.718 | 1.729 |
| 5.340707511102456 | 1.477 | 1.718 | 1.731 |
| 5.343849103756045 | 1.477 | 1.718 | 1.734 |
| 5.346990696409634 | 1.477 | 1.718 | 1.736 |
| 5.350132289063224 | 1.477 | 1.718 | 1.738 |
| 5.353273881716814 | 1.477 | 1.718 | 1.74 |
| 5.356415474370403 | 1.477 | 1.718 | 1.742 |
| 5.359557067023993 | 1.478 | 1.718 | 1.745 |
| 5.362698659677583 | 1.478 | 1.718 | 1.747 |
| 5.365840252331172 | 1.478 | 1.718 | 1.749 |
| 5.368981844984762 | 1.478 | 1.718 | 1.751 |
| 5.372123437638351 | 1.478 | 1.718 | 1.752 |
| 5.375265030291941 | 1.478 | 1.718 | 1.754 |
| 5.378406622945531 | 1.478 | 1.718 | 1.756 |
| 5.38154821559912 | 1.479 | 1.718 | 1.758 |
| 5.38468980825271 | 1.479 | 1.718 | 1.76 |
| 5.387831400906299 | 1.479 | 1.718 | 1.761 |
| 5.39097299355989 | 1.479 | 1.718 | 1.763 |
| 5.394114586213479 | 1.479 | 1.718 | 1.764 |
| 5.397256178867068 | 1.48 | 1.718 | 1.766 |
| 5.400397771520657 | 1.48 | 1.718 | 1.767 |
| 5.403539364174247 | 1.48 | 1.718 | 1.769 |
| 5.406680956827837 | 1.48 | 1.718 | 1.77 |
| 5.409822549481426 | 1.48 | 1.718 | 1.772 |
| 5.412964142135016 | 1.481 | 1.718 | 1.773 |
| 5.416105734788605 | 1.481 | 1.718 | 1.774 |
| 5.419247327442195 | 1.481 | 1.718 | 1.775 |
| 5.422388920095785 | 1.481 | 1.718 | 1.777 |
| 5.425530512749375 | 1.482 | 1.718 | 1.778 |
| 5.428672105402964 | 1.482 | 1.718 | 1.779 |
| 5.431813698056554 | 1.482 | 1.718 | 1.78 |
| 5.434955290710143 | 1.482 | 1.718 | 1.781 |
| 5.438096883363733 | 1.483 | 1.718 | 1.782 |
| 5.441238476017322 | 1.483 | 1.718 | 1.783 |
| 5.444380068670912 | 1.483 | 1.718 | 1.784 |
| 5.447521661324502 | 1.483 | 1.718 | 1.785 |
| 5.450663253978091 | 1.484 | 1.718 | 1.786 |
| 5.453804846631681 | 1.484 | 1.718 | 1.786 |
| 5.456946439285271 | 1.484 | 1.718 | 1.787 |
| 5.46008803193886 | 1.485 | 1.718 | 1.788 |
| 5.46322962459245 | 1.485 | 1.718 | 1.789 |
| 5.466371217246039 | 1.485 | 1.718 | 1.789 |
| 5.46951280989963 | 1.486 | 1.718 | 1.79 |
| 5.472654402553218 | 1.486 | 1.718 | 1.791 |
| 5.475795995206808 | 1.486 | 1.718 | 1.791 |
| 5.478937587860398 | 1.487 | 1.718 | 1.792 |
| 5.482079180513987 | 1.487 | 1.718 | 1.792 |
| 5.485220773167577 | 1.487 | 1.718 | 1.793 |
| 5.488362365821166 | 1.488 | 1.718 | 1.793 |
| 5.491503958474756 | 1.488 | 1.718 | 1.794 |
| 5.494645551128346 | 1.489 | 1.718 | 1.794 |
| 5.497787143781935 | 1.489 | 1.718 | 1.794 |
| 5.500928736435525 | 1.489 | 1.718 | 1.795 |
| 5.504070329089115 | 1.49 | 1.718 | 1.795 |
| 5.507211921742704 | 1.49 | 1.718 | 1.796 |
| 5.510353514396294 | 1.491 | 1.718 | 1.796 |
| 5.513495107049883 | 1.491 | 1.718 | 1.796 |
| 5.516636699703473 | 1.491 | 1.718 | 1.796 |
| 5.519778292357062 | 1.492 | 1.718 | 1.797 |
| 5.522919885010652 | 1.492 | 1.718 | 1.797 |
| 5.526061477664242 | 1.493 | 1.718 | 1.797 |
| 5.529203070317831 | 1.493 | 1.718 | 1.797 |
| 5.532344662971421 | 1.494 | 1.718 | 1.798 |
| 5.535486255625011 | 1.494 | 1.718 | 1.798 |
| 5.5386278482786 | 1.495 | 1.718 | 1.798 |
| 5.54176944093219 | 1.495 | 1.718 | 1.798 |
| 5.544911033585779 | 1.496 | 1.718 | 1.798 |
| 5.54805262623937 | 1.496 | 1.718 | 1.798 |
| 5.551194218892959 | 1.497 | 1.718 | 1.799 |
| 5.554335811546548 | 1.497 | 1.718 | 1.799 |
| 5.557477404200137 | 1.498 | 1.718 | 1.799 |
| 5.560618996853727 | 1.498 | 1.718 | 1.799 |
| 5.563760589507317 | 1.499 | 1.718 | 1.799 |
| 5.566902182160906 | 1.499 | 1.718 | 1.799 |
| 5.570043774814496 | 1.5 | 1.718 | 1.799 |
| 5.573185367468086 | 1.501 | 1.718 | 1.799 |
| 5.576326960121675 | 1.501 | 1.718 | 1.799 |
| 5.579468552775264 | 1.502 | 1.718 | 1.799 |
| 5.582610145428854 | 1.503 | 1.718 | 1.799 |
| 5.585751738082444 | 1.503 | 1.718 | 1.799 |
| 5.588893330736034 | 1.504 | 1.718 | 1.8 |
| 5.592034923389623 | 1.504 | 1.718 | 1.8 |
| 5.595176516043213 | 1.505 | 1.718 | 1.8 |
| 5.598318108696803 | 1.506 | 1.718 | 1.8 |
| 5.601459701350392 | 1.506 | 1.718 | 1.8 |
| 5.604601294003982 | 1.507 | 1.718 | 1.8 |
| 5.607742886657571 | 1.508 | 1.718 | 1.8 |
| 5.610884479311161 | 1.509 | 1.718 | 1.8 |
| 5.61402607196475 | 1.509 | 1.718 | 1.8 |
| 5.61716766461834 | 1.51 | 1.718 | 1.8 |
| 5.62030925727193 | 1.511 | 1.718 | 1.8 |
| 5.623450849925519 | 1.512 | 1.718 | 1.8 |
| 5.626592442579109 | 1.512 | 1.718 | 1.8 |
| 5.629734035232698 | 1.513 | 1.718 | 1.8 |
| 5.632875627886288 | 1.514 | 1.718 | 1.8 |
| 5.636017220539878 | 1.515 | 1.718 | 1.8 |
| 5.639158813193467 | 1.515 | 1.718 | 1.8 |
| 5.642300405847057 | 1.516 | 1.718 | 1.8 |
| 5.645441998500646 | 1.517 | 1.718 | 1.8 |
| 5.648583591154236 | 1.518 | 1.718 | 1.8 |
| 5.651725183807825 | 1.519 | 1.718 | 1.8 |
| 5.654866776461415 | 1.52 | 1.718 | 1.8 |
| 5.658008369115005 | 1.521 | 1.718 | 1.8 |
| 5.661149961768594 | 1.522 | 1.718 | 1.8 |
| 5.664291554422184 | 1.522 | 1.718 | 1.8 |
| 5.667433147075774 | 1.523 | 1.718 | 1.8 |
| 5.670574739729363 | 1.524 | 1.718 | 1.8 |
| 5.673716332382953 | 1.525 | 1.718 | 1.8 |
| 5.676857925036542 | 1.526 | 1.718 | 1.8 |
| 5.679999517690132 | 1.527 | 1.718 | 1.8 |
| 5.683141110343721 | 1.528 | 1.718 | 1.8 |
| 5.686282702997311 | 1.529 | 1.718 | 1.8 |
| 5.689424295650901 | 1.53 | 1.718 | 1.8 |
| 5.69256588830449 | 1.531 | 1.718 | 1.8 |
| 5.69570748095808 | 1.532 | 1.718 | 1.8 |
| 5.69884907361167 | 1.533 | 1.718 | 1.8 |
| 5.701990666265259 | 1.534 | 1.718 | 1.8 |
| 5.705132258918849 | 1.535 | 1.718 | 1.8 |
| 5.708273851572438 | 1.537 | 1.718 | 1.8 |
| 5.711415444226028 | 1.538 | 1.718 | 1.8 |
| 5.714557036879618 | 1.539 | 1.718 | 1.8 |
| 5.717698629533207 | 1.54 | 1.718 | 1.8 |
| 5.720840222186797 | 1.541 | 1.718 | 1.8 |
| 5.723981814840386 | 1.542 | 1.718 | 1.8 |
| 5.727123407493976 | 1.543 | 1.718 | 1.8 |
| 5.730265000147565 | 1.545 | 1.718 | 1.8 |
| 5.733406592801155 | 1.546 | 1.718 | 1.8 |
| 5.736548185454744 | 1.547 | 1.718 | 1.8 |
| 5.739689778108334 | 1.548 | 1.718 | 1.8 |
| 5.742831370761924 | 1.549 | 1.718 | 1.8 |
| 5.745972963415514 | 1.551 | 1.718 | 1.8 |
| 5.749114556069103 | 1.552 | 1.719 | 1.8 |
| 5.752256148722693 | 1.553 | 1.719 | 1.8 |
| 5.755397741376282 | 1.555 | 1.719 | 1.8 |
| 5.758539334029872 | 1.556 | 1.719 | 1.8 |
| 5.761680926683462 | 1.557 | 1.719 | 1.8 |
| 5.764822519337051 | 1.559 | 1.719 | 1.8 |
| 5.767964111990641 | 1.56 | 1.719 | 1.8 |
| 5.77110570464423 | 1.561 | 1.719 | 1.8 |
| 5.77424729729782 | 1.563 | 1.719 | 1.8 |
| 5.77738888995141 | 1.564 | 1.719 | 1.8 |
| 5.780530482605 | 1.565 | 1.719 | 1.8 |
| 5.783672075258588 | 1.567 | 1.719 | 1.8 |
| 5.786813667912178 | 1.568 | 1.719 | 1.8 |
| 5.789955260565768 | 1.57 | 1.719 | 1.8 |
| 5.793096853219358 | 1.571 | 1.719 | 1.8 |
| 5.796238445872947 | 1.573 | 1.72 | 1.8 |
| 5.799380038526537 | 1.574 | 1.72 | 1.8 |
| 5.802521631180126 | 1.576 | 1.72 | 1.8 |
| 5.805663223833715 | 1.577 | 1.72 | 1.8 |
| 5.808804816487306 | 1.579 | 1.72 | 1.8 |
| 5.811946409140895 | 1.58 | 1.72 | 1.8 |
| 5.815088001794485 | 1.582 | 1.72 | 1.8 |
| 5.818229594448074 | 1.584 | 1.72 | 1.8 |
| 5.821371187101663 | 1.585 | 1.721 | 1.8 |
| 5.824512779755254 | 1.587 | 1.721 | 1.8 |
| 5.827654372408843 | 1.588 | 1.721 | 1.8 |
| 5.830795965062433 | 1.59 | 1.721 | 1.8 |
| 5.833937557716022 | 1.592 | 1.721 | 1.8 |
| 5.837079150369612 | 1.593 | 1.721 | 1.8 |
| 5.840220743023201 | 1.595 | 1.722 | 1.8 |
| 5.843362335676791 | 1.597 | 1.722 | 1.8 |
| 5.846503928330381 | 1.599 | 1.722 | 1.8 |
| 5.84964552098397 | 1.6 | 1.722 | 1.8 |
| 5.85278711363756 | 1.602 | 1.722 | 1.8 |
| 5.85592870629115 | 1.604 | 1.723 | 1.8 |
| 5.85907029894474 | 1.606 | 1.723 | 1.8 |
| 5.862211891598329 | 1.608 | 1.723 | 1.8 |
| 5.865353484251918 | 1.609 | 1.723 | 1.8 |
| 5.868495076905508 | 1.611 | 1.724 | 1.8 |
| 5.871636669559098 | 1.613 | 1.724 | 1.8 |
| 5.874778262212687 | 1.615 | 1.724 | 1.8 |
| 5.877919854866277 | 1.617 | 1.725 | 1.8 |
| 5.881061447519866 | 1.619 | 1.725 | 1.8 |
| 5.884203040173456 | 1.621 | 1.725 | 1.8 |
| 5.887344632827046 | 1.623 | 1.726 | 1.8 |
| 5.890486225480635 | 1.624 | 1.726 | 1.8 |
| 5.893627818134224 | 1.626 | 1.727 | 1.8 |
| 5.896769410787814 | 1.628 | 1.727 | 1.8 |
| 5.899911003441404 | 1.63 | 1.727 | 1.8 |
| 5.903052596094994 | 1.632 | 1.728 | 1.8 |
| 5.906194188748583 | 1.634 | 1.728 | 1.8 |
| 5.909335781402172 | 1.636 | 1.729 | 1.8 |
| 5.912477374055762 | 1.639 | 1.729 | 1.8 |
| 5.915618966709352 | 1.641 | 1.73 | 1.8 |
| 5.918760559362942 | 1.643 | 1.73 | 1.8 |
| 5.921902152016531 | 1.645 | 1.731 | 1.8 |
| 5.92504374467012 | 1.647 | 1.731 | 1.8 |
| 5.92818533732371 | 1.649 | 1.732 | 1.8 |
| 5.9313269299773 | 1.651 | 1.733 | 1.8 |
| 5.93446852263089 | 1.653 | 1.733 | 1.8 |
| 5.93761011528448 | 1.655 | 1.734 | 1.8 |
| 5.940751707938068 | 1.658 | 1.735 | 1.8 |
| 5.943893300591658 | 1.66 | 1.735 | 1.8 |
| 5.947034893245248 | 1.662 | 1.736 | 1.801 |
| 5.950176485898837 | 1.664 | 1.737 | 1.801 |
| 5.953318078552427 | 1.667 | 1.738 | 1.801 |
| 5.956459671206017 | 1.669 | 1.738 | 1.801 |
| 5.959601263859606 | 1.671 | 1.739 | 1.801 |
| 5.962742856513196 | 1.673 | 1.74 | 1.801 |
| 5.965884449166785 | 1.676 | 1.741 | 1.801 |
| 5.969026041820375 | 1.678 | 1.742 | 1.801 |
| 5.972167634473964 | 1.68 | 1.743 | 1.801 |
| 5.975309227127554 | 1.683 | 1.743 | 1.802 |
| 5.978450819781144 | 1.685 | 1.744 | 1.802 |
| 5.981592412434733 | 1.687 | 1.745 | 1.802 |
| 5.984734005088323 | 1.69 | 1.746 | 1.802 |
| 5.987875597741913 | 1.692 | 1.747 | 1.802 |
| 5.991017190395502 | 1.695 | 1.748 | 1.802 |
| 5.994158783049092 | 1.697 | 1.749 | 1.803 |
| 5.997300375702681 | 1.7 | 1.751 | 1.803 |
| 6.000441968356271 | 1.702 | 1.752 | 1.803 |
| 6.003583561009861 | 1.704 | 1.753 | 1.803 |
| 6.00672515366345 | 1.707 | 1.754 | 1.804 |
| 6.00986674631704 | 1.709 | 1.755 | 1.804 |
| 6.01300833897063 | 1.712 | 1.756 | 1.804 |
| 6.01614993162422 | 1.714 | 1.758 | 1.805 |
| 6.019291524277808 | 1.717 | 1.759 | 1.805 |
| 6.022433116931398 | 1.72 | 1.76 | 1.805 |
| 6.025574709584988 | 1.722 | 1.762 | 1.806 |
| 6.028716302238577 | 1.725 | 1.763 | 1.806 |
| 6.031857894892167 | 1.727 | 1.764 | 1.807 |
| 6.034999487545757 | 1.73 | 1.766 | 1.807 |
| 6.038141080199346 | 1.732 | 1.767 | 1.808 |
| 6.041282672852935 | 1.735 | 1.769 | 1.808 |
| 6.044424265506525 | 1.738 | 1.77 | 1.809 |
| 6.047565858160115 | 1.74 | 1.772 | 1.809 |
| 6.050707450813704 | 1.743 | 1.774 | 1.81 |
| 6.053849043467294 | 1.746 | 1.775 | 1.811 |
| 6.056990636120884 | 1.748 | 1.777 | 1.811 |
| 6.060132228774473 | 1.751 | 1.778 | 1.812 |
| 6.063273821428063 | 1.754 | 1.78 | 1.813 |
| 6.066415414081653 | 1.757 | 1.782 | 1.814 |
| 6.069557006735242 | 1.759 | 1.784 | 1.814 |
| 6.072698599388831 | 1.762 | 1.786 | 1.815 |
| 6.07584019204242 | 1.765 | 1.787 | 1.816 |
| 6.078981784696011 | 1.768 | 1.789 | 1.817 |
| 6.082123377349601 | 1.77 | 1.791 | 1.818 |
| 6.08526497000319 | 1.773 | 1.793 | 1.819 |
| 6.08840656265678 | 1.776 | 1.795 | 1.82 |
| 6.09154815531037 | 1.779 | 1.797 | 1.821 |
| 6.094689747963959 | 1.782 | 1.799 | 1.822 |
| 6.097831340617549 | 1.784 | 1.801 | 1.823 |
| 6.100972933271138 | 1.787 | 1.803 | 1.825 |
| 6.104114525924728 | 1.79 | 1.805 | 1.826 |
| 6.107256118578317 | 1.793 | 1.807 | 1.827 |
| 6.110397711231907 | 1.796 | 1.809 | 1.829 |
| 6.113539303885497 | 1.799 | 1.812 | 1.83 |
| 6.116680896539086 | 1.802 | 1.814 | 1.831 |
| 6.119822489192675 | 1.804 | 1.816 | 1.833 |
| 6.122964081846265 | 1.807 | 1.818 | 1.834 |
| 6.126105674499855 | 1.81 | 1.821 | 1.836 |
| 6.129247267153445 | 1.813 | 1.823 | 1.837 |
| 6.132388859807034 | 1.816 | 1.825 | 1.839 |
| 6.135530452460624 | 1.819 | 1.828 | 1.841 |
| 6.138672045114213 | 1.822 | 1.83 | 1.842 |
| 6.141813637767803 | 1.825 | 1.833 | 1.844 |
| 6.144955230421393 | 1.828 | 1.835 | 1.846 |
| 6.148096823074982 | 1.831 | 1.838 | 1.848 |
| 6.151238415728571 | 1.834 | 1.84 | 1.85 |
| 6.154380008382161 | 1.837 | 1.843 | 1.852 |
| 6.157521601035751 | 1.84 | 1.845 | 1.854 |
| 6.16066319368934 | 1.843 | 1.848 | 1.856 |
| 6.16380478634293 | 1.846 | 1.851 | 1.858 |
| 6.16694637899652 | 1.849 | 1.853 | 1.86 |
| 6.170087971650109 | 1.852 | 1.856 | 1.862 |
| 6.173229564303698 | 1.855 | 1.859 | 1.865 |
| 6.176371156957289 | 1.858 | 1.861 | 1.867 |
| 6.179512749610878 | 1.861 | 1.864 | 1.869 |
| 6.182654342264468 | 1.864 | 1.867 | 1.871 |
| 6.185795934918057 | 1.867 | 1.87 | 1.874 |
| 6.188937527571647 | 1.87 | 1.873 | 1.876 |
| 6.192079120225237 | 1.873 | 1.875 | 1.879 |
| 6.195220712878826 | 1.876 | 1.878 | 1.881 |
| 6.198362305532415 | 1.879 | 1.881 | 1.884 |
| 6.201503898186005 | 1.882 | 1.884 | 1.886 |
| 6.204645490839594 | 1.885 | 1.887 | 1.889 |
| 6.207787083493184 | 1.889 | 1.89 | 1.892 |
| 6.210928676146774 | 1.892 | 1.893 | 1.895 |
| 6.214070268800364 | 1.895 | 1.896 | 1.897 |
| 6.217211861453953 | 1.898 | 1.899 | 1.9 |
| 6.220353454107543 | 1.901 | 1.902 | 1.903 |
| 6.223495046761133 | 1.904 | 1.905 | 1.906 |
| 6.226636639414722 | 1.907 | 1.908 | 1.909 |
| 6.229778232068312 | 1.91 | 1.911 | 1.911 |
| 6.232919824721901 | 1.913 | 1.914 | 1.914 |
| 6.236061417375491 | 1.916 | 1.917 | 1.917 |
| 6.23920301002908 | 1.92 | 1.92 | 1.92 |
| 6.24234460268267 | 1.923 | 1.923 | 1.923 |
| 6.24548619533626 | 1.926 | 1.926 | 1.926 |
| 6.24862778798985 | 1.929 | 1.929 | 1.929 |
| 6.251769380643438 | 1.932 | 1.932 | 1.932 |
| 6.254910973297028 | 1.935 | 1.935 | 1.935 |
| 6.258052565950618 | 1.938 | 1.938 | 1.939 |
| 6.261194158604208 | 1.942 | 1.942 | 1.942 |
| 6.264335751257797 | 1.945 | 1.945 | 1.945 |
| 6.267477343911387 | 1.948 | 1.948 | 1.948 |
| 6.270618936564976 | 1.951 | 1.951 | 1.951 |
| 6.273760529218566 | 1.954 | 1.954 | 1.954 |
| 6.276902121872155 | 1.957 | 1.957 | 1.957 |
| 6.280043714525745 | 1.96 | 1.96 | 1.96 |
| 6.283185307179335 | 1.963 | 1.963 | 1.963 |